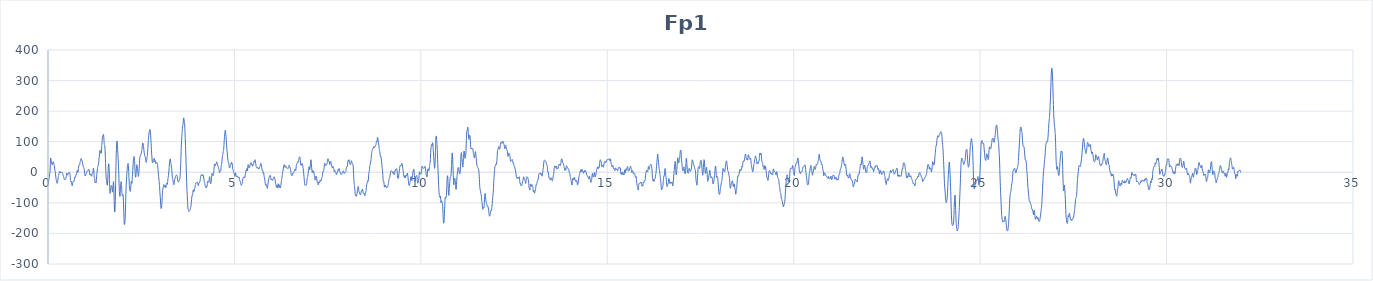
| Category | Fp1 |
|---|---|
| 0.0 | -30.1 |
| 0.0078125 | -34.2 |
| 0.015625 | -29.4 |
| 0.0234375 | -22.9 |
| 0.03125 | -19.9 |
| 0.0390625 | -12.9 |
| 0.046875 | -4.4 |
| 0.0546875 | 4.5 |
| 0.0625 | 26 |
| 0.0703125 | 46.8 |
| 0.078125 | 43.8 |
| 0.0859375 | 34.8 |
| 0.09375 | 35.4 |
| 0.1015625 | 30.7 |
| 0.109375 | 24 |
| 0.1171875 | 25.7 |
| 0.125 | 28.2 |
| 0.1328125 | 31.4 |
| 0.140625 | 34.7 |
| 0.1484375 | 31 |
| 0.15625 | 27.1 |
| 0.1640625 | 25.2 |
| 0.171875 | 17.9 |
| 0.1796875 | 10.5 |
| 0.1875 | 5.8 |
| 0.1953125 | -1.5 |
| 0.203125 | -8.7 |
| 0.2109375 | -15.7 |
| 0.21875 | -23.9 |
| 0.2265625 | -28.2 |
| 0.234375 | -31.4 |
| 0.2421875 | -35.9 |
| 0.25 | -34 |
| 0.2578125 | -29.1 |
| 0.265625 | -25.5 |
| 0.2734375 | -17.5 |
| 0.28125 | -11.3 |
| 0.2890625 | -9.8 |
| 0.296875 | -3.2 |
| 0.3046875 | 2.1 |
| 0.3125 | -0.7 |
| 0.3203125 | -0.9 |
| 0.328125 | 2 |
| 0.3359375 | 0 |
| 0.34375 | -2.1 |
| 0.3515625 | -1.1 |
| 0.359375 | -0.9 |
| 0.3671875 | 0 |
| 0.375 | 0.8 |
| 0.3828125 | -1.6 |
| 0.390625 | -3.5 |
| 0.3984375 | -5.6 |
| 0.40625 | -11 |
| 0.4140625 | -13.5 |
| 0.421875 | -14.4 |
| 0.4296875 | -20 |
| 0.4375 | -23.9 |
| 0.4453125 | -23.2 |
| 0.453125 | -23.8 |
| 0.4609375 | -24.8 |
| 0.46875 | -23.8 |
| 0.4765625 | -21.7 |
| 0.484375 | -18 |
| 0.4921875 | -11.2 |
| 0.5 | -3.8 |
| 0.5078125 | -2.5 |
| 0.515625 | -7.4 |
| 0.5234375 | -9.6 |
| 0.53125 | -6.9 |
| 0.5390625 | -5.1 |
| 0.546875 | -5.8 |
| 0.5546875 | -4.1 |
| 0.5625 | -0.3 |
| 0.5703125 | -0.2 |
| 0.578125 | -2.8 |
| 0.5859375 | -4.4 |
| 0.59375 | -10.8 |
| 0.6015625 | -23.3 |
| 0.609375 | -30.4 |
| 0.6171875 | -29.8 |
| 0.625 | -30.4 |
| 0.6328125 | -34.8 |
| 0.640625 | -40.5 |
| 0.6484375 | -44.1 |
| 0.65625 | -41 |
| 0.6640625 | -34.5 |
| 0.671875 | -30.8 |
| 0.6796875 | -29.3 |
| 0.6875 | -29.5 |
| 0.6953125 | -30.6 |
| 0.703125 | -26.8 |
| 0.7109375 | -19.2 |
| 0.71875 | -15.2 |
| 0.7265625 | -15.6 |
| 0.734375 | -16.6 |
| 0.7421875 | -13.4 |
| 0.75 | -7.4 |
| 0.7578125 | -6 |
| 0.765625 | -7 |
| 0.7734375 | -1.7 |
| 0.78125 | 5.6 |
| 0.7890625 | 5.5 |
| 0.796875 | 0.3 |
| 0.8046875 | 0.4 |
| 0.8125 | 8.8 |
| 0.8203125 | 17.8 |
| 0.828125 | 22.7 |
| 0.8359375 | 24 |
| 0.84375 | 23.2 |
| 0.8515625 | 26.4 |
| 0.859375 | 32.9 |
| 0.8671875 | 35 |
| 0.875 | 37.9 |
| 0.8828125 | 44.4 |
| 0.890625 | 44.3 |
| 0.8984375 | 39.8 |
| 0.90625 | 39.5 |
| 0.9140625 | 39.3 |
| 0.921875 | 34.8 |
| 0.9296875 | 28.6 |
| 0.9375 | 22.7 |
| 0.9453125 | 18.4 |
| 0.953125 | 16.5 |
| 0.9609375 | 15.5 |
| 0.96875 | 11.3 |
| 0.9765625 | 4.5 |
| 0.984375 | -3.1 |
| 0.9921875 | -10.6 |
| 1.0 | -11.7 |
| 1.0078125 | -7.8 |
| 1.015625 | -7.6 |
| 1.0234375 | -6.7 |
| 1.03125 | -1.2 |
| 1.0390625 | 1.5 |
| 1.046875 | 2.1 |
| 1.0546875 | 3.6 |
| 1.0625 | 2.7 |
| 1.0703125 | 3.5 |
| 1.078125 | 8.4 |
| 1.0859375 | 10.1 |
| 1.09375 | 8.7 |
| 1.1015625 | 8.7 |
| 1.109375 | 4.6 |
| 1.1171875 | -4.8 |
| 1.125 | -9.4 |
| 1.1328125 | -7.3 |
| 1.140625 | -5.5 |
| 1.1484375 | -5.7 |
| 1.15625 | -8 |
| 1.1640625 | -12.3 |
| 1.171875 | -12.5 |
| 1.1796875 | -6.9 |
| 1.1875 | -2.9 |
| 1.1953125 | -2.1 |
| 1.203125 | 0.7 |
| 1.2109375 | 7.2 |
| 1.21875 | 13.1 |
| 1.2265625 | 8.6 |
| 1.234375 | -6.9 |
| 1.2421875 | -16.7 |
| 1.25 | -20 |
| 1.2578125 | -28.8 |
| 1.265625 | -34.5 |
| 1.2734375 | -32.4 |
| 1.28125 | -34.3 |
| 1.2890625 | -34.9 |
| 1.296875 | -24.6 |
| 1.3046875 | -11.8 |
| 1.3125 | -3.2 |
| 1.3203125 | 4.2 |
| 1.328125 | 12.3 |
| 1.3359375 | 18.7 |
| 1.34375 | 21.5 |
| 1.3515625 | 24.2 |
| 1.359375 | 31.3 |
| 1.3671875 | 42.1 |
| 1.375 | 52.1 |
| 1.3828125 | 61.2 |
| 1.390625 | 69.9 |
| 1.3984375 | 71.6 |
| 1.40625 | 66.8 |
| 1.4140625 | 63.8 |
| 1.421875 | 61.3 |
| 1.4296875 | 63.6 |
| 1.4375 | 76.8 |
| 1.4453125 | 91.3 |
| 1.453125 | 103.2 |
| 1.4609375 | 114.8 |
| 1.46875 | 119.4 |
| 1.4765625 | 120.2 |
| 1.484375 | 124.2 |
| 1.4921875 | 122.2 |
| 1.5 | 108 |
| 1.5078125 | 93.4 |
| 1.515625 | 89.2 |
| 1.5234375 | 86.7 |
| 1.53125 | 71.6 |
| 1.5390625 | 45.5 |
| 1.546875 | 17.4 |
| 1.5546875 | -5.3 |
| 1.5625 | -18.6 |
| 1.5703125 | -27.5 |
| 1.578125 | -36.2 |
| 1.5859375 | -42 |
| 1.59375 | -41.4 |
| 1.6015625 | -28.6 |
| 1.609375 | -4.7 |
| 1.6171875 | 17.2 |
| 1.625 | 27.8 |
| 1.6328125 | 25.4 |
| 1.640625 | 9.3 |
| 1.6484375 | -20.3 |
| 1.65625 | -53.1 |
| 1.6640625 | -69.4 |
| 1.671875 | -66.4 |
| 1.6796875 | -58.5 |
| 1.6875 | -50.1 |
| 1.6953125 | -43.6 |
| 1.703125 | -44.2 |
| 1.7109375 | -46.4 |
| 1.71875 | -51.6 |
| 1.7265625 | -63.2 |
| 1.734375 | -64.7 |
| 1.7421875 | -51.4 |
| 1.75 | -36.9 |
| 1.7578125 | -30.4 |
| 1.765625 | -46.6 |
| 1.7734375 | -85 |
| 1.78125 | -116.8 |
| 1.7890625 | -130.1 |
| 1.796875 | -125.4 |
| 1.8046875 | -93 |
| 1.8125 | -42.2 |
| 1.8203125 | 6.5 |
| 1.828125 | 48.1 |
| 1.8359375 | 78.9 |
| 1.84375 | 96.9 |
| 1.8515625 | 102.5 |
| 1.859375 | 92.3 |
| 1.8671875 | 74.4 |
| 1.875 | 58.3 |
| 1.8828125 | 40.7 |
| 1.890625 | 20.3 |
| 1.8984375 | -4.7 |
| 1.90625 | -36.6 |
| 1.9140625 | -63 |
| 1.921875 | -75.9 |
| 1.9296875 | -79 |
| 1.9375 | -69.1 |
| 1.9453125 | -49.1 |
| 1.953125 | -34.6 |
| 1.9609375 | -30.5 |
| 1.96875 | -35.8 |
| 1.9765625 | -51.9 |
| 1.984375 | -69 |
| 1.9921875 | -75.9 |
| 2.0 | -74.7 |
| 2.0078125 | -72.4 |
| 2.015625 | -76.7 |
| 2.0234375 | -94.9 |
| 2.03125 | -124.9 |
| 2.0390625 | -154.7 |
| 2.046875 | -170.6 |
| 2.0546875 | -170.4 |
| 2.0625 | -162.5 |
| 2.0703125 | -146.3 |
| 2.078125 | -116.8 |
| 2.0859375 | -82.8 |
| 2.09375 | -54.2 |
| 2.1015625 | -31 |
| 2.109375 | -14.6 |
| 2.1171875 | -1.3 |
| 2.125 | 13.3 |
| 2.1328125 | 22.1 |
| 2.140625 | 25.9 |
| 2.1484375 | 29.2 |
| 2.15625 | 21.7 |
| 2.1640625 | 2.8 |
| 2.171875 | -17.4 |
| 2.1796875 | -39.2 |
| 2.1875 | -55.5 |
| 2.1953125 | -59.7 |
| 2.203125 | -61.9 |
| 2.2109375 | -61.9 |
| 2.21875 | -51.2 |
| 2.2265625 | -36.6 |
| 2.234375 | -29.6 |
| 2.2421875 | -33 |
| 2.25 | -36.2 |
| 2.2578125 | -26.6 |
| 2.265625 | -9.5 |
| 2.2734375 | 5.5 |
| 2.28125 | 21.3 |
| 2.2890625 | 36.3 |
| 2.296875 | 45.3 |
| 2.3046875 | 51.3 |
| 2.3125 | 51 |
| 2.3203125 | 38.3 |
| 2.328125 | 19.1 |
| 2.3359375 | 1.5 |
| 2.34375 | -11.9 |
| 2.3515625 | -16.4 |
| 2.359375 | -10.3 |
| 2.3671875 | 3.9 |
| 2.375 | 19.3 |
| 2.3828125 | 25.1 |
| 2.390625 | 20.1 |
| 2.3984375 | 13.4 |
| 2.40625 | 6.7 |
| 2.4140625 | -3.8 |
| 2.421875 | -13.8 |
| 2.4296875 | -12.4 |
| 2.4375 | -0.5 |
| 2.4453125 | 13.1 |
| 2.453125 | 29.2 |
| 2.4609375 | 44.8 |
| 2.46875 | 51.6 |
| 2.4765625 | 55 |
| 2.484375 | 58.4 |
| 2.4921875 | 58.3 |
| 2.5 | 60.6 |
| 2.5078125 | 66.9 |
| 2.515625 | 71.6 |
| 2.5234375 | 78.7 |
| 2.53125 | 88.9 |
| 2.5390625 | 94.9 |
| 2.546875 | 95.5 |
| 2.5546875 | 92.1 |
| 2.5625 | 84.3 |
| 2.5703125 | 74.3 |
| 2.578125 | 65.8 |
| 2.5859375 | 60 |
| 2.59375 | 55.3 |
| 2.6015625 | 51.9 |
| 2.609375 | 48.9 |
| 2.6171875 | 42.9 |
| 2.625 | 35.3 |
| 2.6328125 | 32.4 |
| 2.640625 | 35.6 |
| 2.6484375 | 41.5 |
| 2.65625 | 47.5 |
| 2.6640625 | 55.1 |
| 2.671875 | 66.5 |
| 2.6796875 | 80.6 |
| 2.6875 | 96.6 |
| 2.6953125 | 111.1 |
| 2.703125 | 120.8 |
| 2.7109375 | 128.8 |
| 2.71875 | 135.5 |
| 2.7265625 | 138.9 |
| 2.734375 | 140.2 |
| 2.7421875 | 136.2 |
| 2.75 | 125.5 |
| 2.7578125 | 111.8 |
| 2.765625 | 93.6 |
| 2.7734375 | 73.6 |
| 2.78125 | 59.3 |
| 2.7890625 | 46.4 |
| 2.796875 | 34 |
| 2.8046875 | 30.4 |
| 2.8125 | 32.8 |
| 2.8203125 | 35.7 |
| 2.828125 | 39.9 |
| 2.8359375 | 42.9 |
| 2.84375 | 44.8 |
| 2.8515625 | 45.5 |
| 2.859375 | 39 |
| 2.8671875 | 33.8 |
| 2.875 | 37.7 |
| 2.8828125 | 36.6 |
| 2.890625 | 28.8 |
| 2.8984375 | 28.1 |
| 2.90625 | 31.6 |
| 2.9140625 | 31.9 |
| 2.921875 | 31.3 |
| 2.9296875 | 30.1 |
| 2.9375 | 26 |
| 2.9453125 | 16.5 |
| 2.953125 | 3.9 |
| 2.9609375 | -6 |
| 2.96875 | -15.2 |
| 2.9765625 | -25.4 |
| 2.984375 | -34.4 |
| 2.9921875 | -46.7 |
| 3.0 | -62.9 |
| 3.0078125 | -76.3 |
| 3.015625 | -90.8 |
| 3.0234375 | -108.3 |
| 3.03125 | -117.8 |
| 3.0390625 | -117.9 |
| 3.046875 | -114.5 |
| 3.0546875 | -101.6 |
| 3.0625 | -80.2 |
| 3.0703125 | -65.1 |
| 3.078125 | -57.5 |
| 3.0859375 | -50.7 |
| 3.09375 | -46.3 |
| 3.1015625 | -42.6 |
| 3.109375 | -40.3 |
| 3.1171875 | -44.5 |
| 3.125 | -48.6 |
| 3.1328125 | -45.8 |
| 3.140625 | -42.4 |
| 3.1484375 | -45.5 |
| 3.15625 | -50.5 |
| 3.1640625 | -47.5 |
| 3.171875 | -39.3 |
| 3.1796875 | -35.9 |
| 3.1875 | -36.8 |
| 3.1953125 | -39.2 |
| 3.203125 | -38.4 |
| 3.2109375 | -29.1 |
| 3.21875 | -20.1 |
| 3.2265625 | -15 |
| 3.234375 | -5.8 |
| 3.2421875 | 4.4 |
| 3.25 | 15.7 |
| 3.2578125 | 30.9 |
| 3.265625 | 39.6 |
| 3.2734375 | 42.5 |
| 3.28125 | 43.8 |
| 3.2890625 | 37 |
| 3.296875 | 28.8 |
| 3.3046875 | 24.2 |
| 3.3125 | 16.4 |
| 3.3203125 | 6.4 |
| 3.328125 | -6.1 |
| 3.3359375 | -18.2 |
| 3.34375 | -21.3 |
| 3.3515625 | -24.4 |
| 3.359375 | -33.2 |
| 3.3671875 | -38.6 |
| 3.375 | -40.8 |
| 3.3828125 | -38.1 |
| 3.390625 | -28.9 |
| 3.3984375 | -23.8 |
| 3.40625 | -21.4 |
| 3.4140625 | -15.5 |
| 3.421875 | -12.7 |
| 3.4296875 | -12.2 |
| 3.4375 | -9.7 |
| 3.4453125 | -9 |
| 3.453125 | -9.5 |
| 3.4609375 | -11.4 |
| 3.46875 | -17.9 |
| 3.4765625 | -25.3 |
| 3.484375 | -29.6 |
| 3.4921875 | -31.3 |
| 3.5 | -31.9 |
| 3.5078125 | -31.2 |
| 3.515625 | -28.6 |
| 3.5234375 | -26.1 |
| 3.53125 | -23.6 |
| 3.5390625 | -16.7 |
| 3.546875 | -5.3 |
| 3.5546875 | 11.5 |
| 3.5625 | 38.3 |
| 3.5703125 | 68.3 |
| 3.578125 | 92.1 |
| 3.5859375 | 109.6 |
| 3.59375 | 124 |
| 3.6015625 | 137.7 |
| 3.609375 | 148.3 |
| 3.6171875 | 153.3 |
| 3.625 | 161.2 |
| 3.6328125 | 173.8 |
| 3.640625 | 178.1 |
| 3.6484375 | 172.5 |
| 3.65625 | 166.8 |
| 3.6640625 | 159.6 |
| 3.671875 | 141.4 |
| 3.6796875 | 114.2 |
| 3.6875 | 88.1 |
| 3.6953125 | 62.3 |
| 3.703125 | 31.5 |
| 3.7109375 | -0.4 |
| 3.71875 | -30.7 |
| 3.7265625 | -56.7 |
| 3.734375 | -75.4 |
| 3.7421875 | -94.4 |
| 3.75 | -113.3 |
| 3.7578125 | -120.6 |
| 3.765625 | -122.2 |
| 3.7734375 | -126.6 |
| 3.78125 | -128.4 |
| 3.7890625 | -126.7 |
| 3.796875 | -125.6 |
| 3.8046875 | -124.4 |
| 3.8125 | -122 |
| 3.8203125 | -118.8 |
| 3.828125 | -115.5 |
| 3.8359375 | -108.7 |
| 3.84375 | -98.1 |
| 3.8515625 | -88.6 |
| 3.859375 | -80 |
| 3.8671875 | -74.6 |
| 3.875 | -75.2 |
| 3.8828125 | -70.6 |
| 3.890625 | -59.9 |
| 3.8984375 | -57.1 |
| 3.90625 | -61.5 |
| 3.9140625 | -63.3 |
| 3.921875 | -60.5 |
| 3.9296875 | -55.9 |
| 3.9375 | -52.7 |
| 3.9453125 | -47.6 |
| 3.953125 | -39.7 |
| 3.9609375 | -36.7 |
| 3.96875 | -36.7 |
| 3.9765625 | -33.5 |
| 3.984375 | -31.9 |
| 3.9921875 | -33.3 |
| 4.0 | -33 |
| 4.0078125 | -32.6 |
| 4.015625 | -35.2 |
| 4.0234375 | -40.8 |
| 4.03125 | -44.1 |
| 4.0390625 | -40.4 |
| 4.046875 | -35.3 |
| 4.0546875 | -34.5 |
| 4.0625 | -33.7 |
| 4.0703125 | -30.7 |
| 4.078125 | -27.7 |
| 4.0859375 | -21.5 |
| 4.09375 | -13.1 |
| 4.1015625 | -9.5 |
| 4.109375 | -9.8 |
| 4.1171875 | -9 |
| 4.125 | -7.4 |
| 4.1328125 | -8.2 |
| 4.140625 | -11.6 |
| 4.1484375 | -12 |
| 4.15625 | -8.5 |
| 4.1640625 | -9.3 |
| 4.171875 | -15.3 |
| 4.1796875 | -21.8 |
| 4.1875 | -28.3 |
| 4.1953125 | -31.9 |
| 4.203125 | -34.1 |
| 4.2109375 | -41.3 |
| 4.21875 | -46.6 |
| 4.2265625 | -46.9 |
| 4.234375 | -50.2 |
| 4.2421875 | -50.9 |
| 4.25 | -46.8 |
| 4.2578125 | -48.1 |
| 4.265625 | -47.4 |
| 4.2734375 | -36.6 |
| 4.28125 | -29.7 |
| 4.2890625 | -31.4 |
| 4.296875 | -32.2 |
| 4.3046875 | -32.2 |
| 4.3125 | -32.2 |
| 4.3203125 | -26.8 |
| 4.328125 | -17.3 |
| 4.3359375 | -14.1 |
| 4.34375 | -22.3 |
| 4.3515625 | -32.9 |
| 4.359375 | -37.1 |
| 4.3671875 | -37 |
| 4.375 | -33.2 |
| 4.3828125 | -22.9 |
| 4.390625 | -10.5 |
| 4.3984375 | -4 |
| 4.40625 | -4.3 |
| 4.4140625 | -7.7 |
| 4.421875 | -10.9 |
| 4.4296875 | -11.1 |
| 4.4375 | -7.5 |
| 4.4453125 | 0.1 |
| 4.453125 | 11.3 |
| 4.4609375 | 21.8 |
| 4.46875 | 27.4 |
| 4.4765625 | 25.9 |
| 4.484375 | 21.6 |
| 4.4921875 | 22.6 |
| 4.5 | 26 |
| 4.5078125 | 27 |
| 4.515625 | 30.5 |
| 4.5234375 | 34.2 |
| 4.53125 | 32.8 |
| 4.5390625 | 28.9 |
| 4.546875 | 24.3 |
| 4.5546875 | 21 |
| 4.5625 | 19 |
| 4.5703125 | 15.3 |
| 4.578125 | 12.7 |
| 4.5859375 | 9.4 |
| 4.59375 | 2.1 |
| 4.6015625 | -1.2 |
| 4.609375 | 1.8 |
| 4.6171875 | 4.1 |
| 4.625 | 3.8 |
| 4.6328125 | 5.6 |
| 4.640625 | 15 |
| 4.6484375 | 24.4 |
| 4.65625 | 26.6 |
| 4.6640625 | 33.9 |
| 4.671875 | 46.6 |
| 4.6796875 | 52.3 |
| 4.6875 | 58 |
| 4.6953125 | 66.5 |
| 4.703125 | 69.2 |
| 4.7109375 | 74 |
| 4.71875 | 88 |
| 4.7265625 | 103.7 |
| 4.734375 | 116.8 |
| 4.7421875 | 127.3 |
| 4.75 | 135.4 |
| 4.7578125 | 137.6 |
| 4.765625 | 129.7 |
| 4.7734375 | 117.9 |
| 4.78125 | 106 |
| 4.7890625 | 89.8 |
| 4.796875 | 75.4 |
| 4.8046875 | 66.2 |
| 4.8125 | 56 |
| 4.8203125 | 46.6 |
| 4.828125 | 38.4 |
| 4.8359375 | 31.5 |
| 4.84375 | 31.1 |
| 4.8515625 | 27.9 |
| 4.859375 | 17.6 |
| 4.8671875 | 13.8 |
| 4.875 | 15.3 |
| 4.8828125 | 17 |
| 4.890625 | 22.7 |
| 4.8984375 | 24.3 |
| 4.90625 | 24.6 |
| 4.9140625 | 31.8 |
| 4.921875 | 32.8 |
| 4.9296875 | 28.5 |
| 4.9375 | 29.2 |
| 4.9453125 | 23.5 |
| 4.953125 | 12.2 |
| 4.9609375 | 7.9 |
| 4.96875 | 5.5 |
| 4.9765625 | 2 |
| 4.984375 | -0.7 |
| 4.9921875 | -4.4 |
| 5.0 | -8.3 |
| 5.0078125 | -12.6 |
| 5.015625 | -12.7 |
| 5.0234375 | -4.5 |
| 5.03125 | -1.7 |
| 5.0390625 | -8.7 |
| 5.046875 | -12.3 |
| 5.0546875 | -12.5 |
| 5.0625 | -14.9 |
| 5.0703125 | -14.9 |
| 5.078125 | -12.3 |
| 5.0859375 | -12.5 |
| 5.09375 | -15.4 |
| 5.1015625 | -16.9 |
| 5.109375 | -18 |
| 5.1171875 | -19.4 |
| 5.125 | -17.2 |
| 5.1328125 | -17.3 |
| 5.140625 | -24.5 |
| 5.1484375 | -28.6 |
| 5.15625 | -30.3 |
| 5.1640625 | -36 |
| 5.171875 | -39.1 |
| 5.1796875 | -40.9 |
| 5.1875 | -42.7 |
| 5.1953125 | -39.3 |
| 5.203125 | -36.8 |
| 5.2109375 | -34.7 |
| 5.21875 | -25.9 |
| 5.2265625 | -19.7 |
| 5.234375 | -18.8 |
| 5.2421875 | -16.6 |
| 5.25 | -16.2 |
| 5.2578125 | -15.8 |
| 5.265625 | -14.6 |
| 5.2734375 | -17.7 |
| 5.28125 | -17.1 |
| 5.2890625 | -9.1 |
| 5.296875 | -3.4 |
| 5.3046875 | 1.5 |
| 5.3125 | 6.2 |
| 5.3203125 | 4.4 |
| 5.328125 | 6.2 |
| 5.3359375 | 12.4 |
| 5.34375 | 7.5 |
| 5.3515625 | 4.7 |
| 5.359375 | 18 |
| 5.3671875 | 25.2 |
| 5.375 | 19.4 |
| 5.3828125 | 15.6 |
| 5.390625 | 14.4 |
| 5.3984375 | 14.8 |
| 5.40625 | 17.5 |
| 5.4140625 | 20.1 |
| 5.421875 | 24.9 |
| 5.4296875 | 28.6 |
| 5.4375 | 28.6 |
| 5.4453125 | 31.3 |
| 5.453125 | 30.8 |
| 5.4609375 | 24.7 |
| 5.46875 | 24.2 |
| 5.4765625 | 25.5 |
| 5.484375 | 20.8 |
| 5.4921875 | 20.5 |
| 5.5 | 25.5 |
| 5.5078125 | 25.9 |
| 5.515625 | 28.4 |
| 5.5234375 | 36.1 |
| 5.53125 | 36.4 |
| 5.5390625 | 34.4 |
| 5.546875 | 39.6 |
| 5.5546875 | 40.8 |
| 5.5625 | 34.1 |
| 5.5703125 | 28.4 |
| 5.578125 | 22.7 |
| 5.5859375 | 17.3 |
| 5.59375 | 16.4 |
| 5.6015625 | 15.2 |
| 5.609375 | 13.3 |
| 5.6171875 | 14.9 |
| 5.625 | 16.4 |
| 5.6328125 | 14 |
| 5.640625 | 11.8 |
| 5.6484375 | 11.6 |
| 5.65625 | 11 |
| 5.6640625 | 12.1 |
| 5.671875 | 16.2 |
| 5.6796875 | 19 |
| 5.6875 | 19.6 |
| 5.6953125 | 22.6 |
| 5.703125 | 27.8 |
| 5.7109375 | 29.1 |
| 5.71875 | 25.2 |
| 5.7265625 | 20.9 |
| 5.734375 | 14.9 |
| 5.7421875 | 7.6 |
| 5.75 | 6.8 |
| 5.7578125 | 6.8 |
| 5.765625 | -0.8 |
| 5.7734375 | -3.7 |
| 5.78125 | -0.8 |
| 5.7890625 | -5.6 |
| 5.796875 | -13.7 |
| 5.8046875 | -18.4 |
| 5.8125 | -23.8 |
| 5.8203125 | -30.6 |
| 5.828125 | -38.1 |
| 5.8359375 | -42.6 |
| 5.84375 | -40.7 |
| 5.8515625 | -39.7 |
| 5.859375 | -42.6 |
| 5.8671875 | -45.8 |
| 5.875 | -50 |
| 5.8828125 | -52.7 |
| 5.890625 | -47.7 |
| 5.8984375 | -38.7 |
| 5.90625 | -31.6 |
| 5.9140625 | -25.8 |
| 5.921875 | -21.7 |
| 5.9296875 | -18.2 |
| 5.9375 | -13.1 |
| 5.9453125 | -10.7 |
| 5.953125 | -11.9 |
| 5.9609375 | -11 |
| 5.96875 | -12.3 |
| 5.9765625 | -20.2 |
| 5.984375 | -25.2 |
| 5.9921875 | -23.1 |
| 6.0 | -22.8 |
| 6.0078125 | -25.9 |
| 6.015625 | -26.6 |
| 6.0234375 | -26.2 |
| 6.03125 | -25.8 |
| 6.0390625 | -21.6 |
| 6.046875 | -18.3 |
| 6.0546875 | -18.3 |
| 6.0625 | -15.1 |
| 6.0703125 | -15.3 |
| 6.078125 | -20 |
| 6.0859375 | -20.5 |
| 6.09375 | -26 |
| 6.1015625 | -36.7 |
| 6.109375 | -39 |
| 6.1171875 | -42.4 |
| 6.125 | -49.1 |
| 6.1328125 | -46.2 |
| 6.140625 | -41.9 |
| 6.1484375 | -46.6 |
| 6.15625 | -51.6 |
| 6.1640625 | -47.7 |
| 6.171875 | -38.7 |
| 6.1796875 | -38.4 |
| 6.1875 | -46.4 |
| 6.1953125 | -49.6 |
| 6.203125 | -45.5 |
| 6.2109375 | -41.1 |
| 6.21875 | -43.8 |
| 6.2265625 | -50.7 |
| 6.234375 | -50.7 |
| 6.2421875 | -45.7 |
| 6.25 | -39.9 |
| 6.2578125 | -30.4 |
| 6.265625 | -23.9 |
| 6.2734375 | -20 |
| 6.28125 | -11 |
| 6.2890625 | -3.3 |
| 6.296875 | 1.3 |
| 6.3046875 | 7.5 |
| 6.3125 | 12.3 |
| 6.3203125 | 17.5 |
| 6.328125 | 23.7 |
| 6.3359375 | 24.7 |
| 6.34375 | 21.2 |
| 6.3515625 | 17.1 |
| 6.359375 | 16 |
| 6.3671875 | 19.8 |
| 6.375 | 21.4 |
| 6.3828125 | 19.1 |
| 6.390625 | 18.3 |
| 6.3984375 | 16.5 |
| 6.40625 | 13.1 |
| 6.4140625 | 12.9 |
| 6.421875 | 13.4 |
| 6.4296875 | 12.3 |
| 6.4375 | 12.9 |
| 6.4453125 | 13.5 |
| 6.453125 | 13.9 |
| 6.4609375 | 19.1 |
| 6.46875 | 23.5 |
| 6.4765625 | 20.4 |
| 6.484375 | 16.7 |
| 6.4921875 | 15.8 |
| 6.5 | 12.4 |
| 6.5078125 | 6.4 |
| 6.515625 | -0.5 |
| 6.5234375 | -6.5 |
| 6.53125 | -8.7 |
| 6.5390625 | -10.7 |
| 6.546875 | -11.1 |
| 6.5546875 | -5.9 |
| 6.5625 | -3.4 |
| 6.5703125 | -4.9 |
| 6.578125 | -3.3 |
| 6.5859375 | -1.4 |
| 6.59375 | 0.3 |
| 6.6015625 | 4.3 |
| 6.609375 | 6.2 |
| 6.6171875 | 7.3 |
| 6.625 | 10.7 |
| 6.6328125 | 10.7 |
| 6.640625 | 6 |
| 6.6484375 | 7 |
| 6.65625 | 17.5 |
| 6.6640625 | 25.5 |
| 6.671875 | 26.3 |
| 6.6796875 | 29 |
| 6.6875 | 31.3 |
| 6.6953125 | 30.3 |
| 6.703125 | 33.8 |
| 6.7109375 | 36.8 |
| 6.71875 | 35.7 |
| 6.7265625 | 40.8 |
| 6.734375 | 47.5 |
| 6.7421875 | 49.2 |
| 6.75 | 50.7 |
| 6.7578125 | 48.1 |
| 6.765625 | 39.4 |
| 6.7734375 | 30.9 |
| 6.78125 | 24.8 |
| 6.7890625 | 22.1 |
| 6.796875 | 23.6 |
| 6.8046875 | 27.2 |
| 6.8125 | 28.9 |
| 6.8203125 | 26.6 |
| 6.828125 | 23.8 |
| 6.8359375 | 19.8 |
| 6.84375 | 11.9 |
| 6.8515625 | 3.5 |
| 6.859375 | -5.2 |
| 6.8671875 | -16.1 |
| 6.875 | -27.2 |
| 6.8828125 | -37.5 |
| 6.890625 | -42.1 |
| 6.8984375 | -40.9 |
| 6.90625 | -41.9 |
| 6.9140625 | -43.4 |
| 6.921875 | -42 |
| 6.9296875 | -41.5 |
| 6.9375 | -37.2 |
| 6.9453125 | -26.3 |
| 6.953125 | -18.6 |
| 6.9609375 | -16.8 |
| 6.96875 | -12.4 |
| 6.9765625 | -4.2 |
| 6.984375 | 3.7 |
| 6.9921875 | 12.2 |
| 7.0 | 18 |
| 7.0078125 | 14.9 |
| 7.015625 | 8.7 |
| 7.0234375 | 9.4 |
| 7.03125 | 17.3 |
| 7.0390625 | 28.8 |
| 7.046875 | 39.4 |
| 7.0546875 | 41 |
| 7.0625 | 30.2 |
| 7.0703125 | 16.7 |
| 7.078125 | 6.6 |
| 7.0859375 | -1 |
| 7.09375 | -0.5 |
| 7.1015625 | 5.6 |
| 7.109375 | 4.9 |
| 7.1171875 | 2.8 |
| 7.125 | 3.5 |
| 7.1328125 | -2.1 |
| 7.140625 | -9.6 |
| 7.1484375 | -14.3 |
| 7.15625 | -21.5 |
| 7.1640625 | -25.7 |
| 7.171875 | -20.8 |
| 7.1796875 | -13.9 |
| 7.1875 | -12.3 |
| 7.1953125 | -13.9 |
| 7.203125 | -15.4 |
| 7.2109375 | -22.4 |
| 7.21875 | -32 |
| 7.2265625 | -32.2 |
| 7.234375 | -32.4 |
| 7.2421875 | -39.8 |
| 7.25 | -41 |
| 7.2578125 | -35.6 |
| 7.265625 | -32.1 |
| 7.2734375 | -31.2 |
| 7.28125 | -33.9 |
| 7.2890625 | -33.5 |
| 7.296875 | -26.9 |
| 7.3046875 | -25.2 |
| 7.3125 | -28.4 |
| 7.3203125 | -28.7 |
| 7.328125 | -26.1 |
| 7.3359375 | -21.7 |
| 7.34375 | -17.8 |
| 7.3515625 | -16.2 |
| 7.359375 | -10.8 |
| 7.3671875 | -1.3 |
| 7.375 | 3.8 |
| 7.3828125 | 3.3 |
| 7.390625 | 3.9 |
| 7.3984375 | 8.2 |
| 7.40625 | 15.6 |
| 7.4140625 | 25 |
| 7.421875 | 30.2 |
| 7.4296875 | 26.7 |
| 7.4375 | 22.4 |
| 7.4453125 | 23.1 |
| 7.453125 | 23.2 |
| 7.4609375 | 22.6 |
| 7.46875 | 24.2 |
| 7.4765625 | 25 |
| 7.484375 | 28.3 |
| 7.4921875 | 36.1 |
| 7.5 | 42.1 |
| 7.5078125 | 44.5 |
| 7.515625 | 42.8 |
| 7.5234375 | 37.8 |
| 7.53125 | 37 |
| 7.5390625 | 36.5 |
| 7.546875 | 29.8 |
| 7.5546875 | 25.3 |
| 7.5625 | 27.4 |
| 7.5703125 | 32.1 |
| 7.578125 | 36.3 |
| 7.5859375 | 34.9 |
| 7.59375 | 28.5 |
| 7.6015625 | 23.4 |
| 7.609375 | 20.2 |
| 7.6171875 | 17.1 |
| 7.625 | 14.2 |
| 7.6328125 | 15 |
| 7.640625 | 18.9 |
| 7.6484375 | 18.8 |
| 7.65625 | 15.8 |
| 7.6640625 | 12.1 |
| 7.671875 | 5 |
| 7.6796875 | 2.2 |
| 7.6875 | 5.9 |
| 7.6953125 | 5.2 |
| 7.703125 | 2.5 |
| 7.7109375 | 2.5 |
| 7.71875 | -0.3 |
| 7.7265625 | -4.6 |
| 7.734375 | -7.3 |
| 7.7421875 | -7.6 |
| 7.75 | -3.1 |
| 7.7578125 | 0.1 |
| 7.765625 | -0.2 |
| 7.7734375 | 4.6 |
| 7.78125 | 9 |
| 7.7890625 | 6.3 |
| 7.796875 | 7.2 |
| 7.8046875 | 12.2 |
| 7.8125 | 10.7 |
| 7.8203125 | 5 |
| 7.828125 | 2 |
| 7.8359375 | 0 |
| 7.84375 | -3.3 |
| 7.8515625 | -5.4 |
| 7.859375 | -4.9 |
| 7.8671875 | -5.6 |
| 7.875 | -6.9 |
| 7.8828125 | -3.9 |
| 7.890625 | -0.1 |
| 7.8984375 | 0.4 |
| 7.90625 | 1.9 |
| 7.9140625 | 4.5 |
| 7.921875 | 4.7 |
| 7.9296875 | 2.3 |
| 7.9375 | -1.9 |
| 7.9453125 | -3.7 |
| 7.953125 | -2.3 |
| 7.9609375 | -2 |
| 7.96875 | -1.6 |
| 7.9765625 | 0.6 |
| 7.984375 | 1.9 |
| 7.9921875 | 5.5 |
| 8.0 | 12.8 |
| 8.0078125 | 17.6 |
| 8.015625 | 17.6 |
| 8.0234375 | 17.2 |
| 8.03125 | 22 |
| 8.0390625 | 32.3 |
| 8.046875 | 38.1 |
| 8.0546875 | 36.2 |
| 8.0625 | 36.8 |
| 8.0703125 | 41.2 |
| 8.078125 | 39.7 |
| 8.0859375 | 32.8 |
| 8.09375 | 27.5 |
| 8.1015625 | 26.4 |
| 8.109375 | 26.3 |
| 8.1171875 | 25.1 |
| 8.125 | 28.7 |
| 8.1328125 | 36.8 |
| 8.140625 | 37.5 |
| 8.1484375 | 32.2 |
| 8.15625 | 31.2 |
| 8.1640625 | 30.3 |
| 8.171875 | 26.8 |
| 8.1796875 | 24.5 |
| 8.1875 | 16.6 |
| 8.1953125 | -2.5 |
| 8.203125 | -23 |
| 8.2109375 | -35.3 |
| 8.21875 | -42.7 |
| 8.2265625 | -51.8 |
| 8.234375 | -63.5 |
| 8.2421875 | -73.4 |
| 8.25 | -76.1 |
| 8.2578125 | -73.8 |
| 8.265625 | -75.8 |
| 8.2734375 | -78.4 |
| 8.28125 | -74.9 |
| 8.2890625 | -68.6 |
| 8.296875 | -60.6 |
| 8.3046875 | -52.7 |
| 8.3125 | -48.6 |
| 8.3203125 | -45.9 |
| 8.328125 | -49.6 |
| 8.3359375 | -60.2 |
| 8.34375 | -64.3 |
| 8.3515625 | -64.9 |
| 8.359375 | -70.1 |
| 8.3671875 | -72.8 |
| 8.375 | -73.3 |
| 8.3828125 | -73.8 |
| 8.390625 | -69.8 |
| 8.3984375 | -64.8 |
| 8.40625 | -61.5 |
| 8.4140625 | -59 |
| 8.421875 | -59 |
| 8.4296875 | -56.8 |
| 8.4375 | -54.9 |
| 8.4453125 | -61.3 |
| 8.453125 | -67.3 |
| 8.4609375 | -67.7 |
| 8.46875 | -69.7 |
| 8.4765625 | -70.8 |
| 8.484375 | -69.5 |
| 8.4921875 | -73.4 |
| 8.5 | -77.3 |
| 8.5078125 | -72.2 |
| 8.515625 | -66 |
| 8.5234375 | -64.7 |
| 8.53125 | -60.4 |
| 8.5390625 | -50 |
| 8.546875 | -41.1 |
| 8.5546875 | -37.1 |
| 8.5625 | -34.1 |
| 8.5703125 | -29.1 |
| 8.578125 | -27.1 |
| 8.5859375 | -29.9 |
| 8.59375 | -24.6 |
| 8.6015625 | -8.3 |
| 8.609375 | 1.6 |
| 8.6171875 | 4.8 |
| 8.625 | 13.7 |
| 8.6328125 | 22 |
| 8.640625 | 25.4 |
| 8.6484375 | 30.7 |
| 8.65625 | 35.8 |
| 8.6640625 | 41.1 |
| 8.671875 | 51.6 |
| 8.6796875 | 61.8 |
| 8.6875 | 68.2 |
| 8.6953125 | 72 |
| 8.703125 | 73.8 |
| 8.7109375 | 77.2 |
| 8.71875 | 79.6 |
| 8.7265625 | 79.5 |
| 8.734375 | 83 |
| 8.7421875 | 84.4 |
| 8.75 | 80.7 |
| 8.7578125 | 81 |
| 8.765625 | 82.8 |
| 8.7734375 | 83.7 |
| 8.78125 | 87.3 |
| 8.7890625 | 88.3 |
| 8.796875 | 89.8 |
| 8.8046875 | 97.8 |
| 8.8125 | 101.6 |
| 8.8203125 | 100.3 |
| 8.828125 | 105.8 |
| 8.8359375 | 113.6 |
| 8.84375 | 113.7 |
| 8.8515625 | 107 |
| 8.859375 | 99 |
| 8.8671875 | 93 |
| 8.875 | 86.5 |
| 8.8828125 | 77.8 |
| 8.890625 | 71.7 |
| 8.8984375 | 67.7 |
| 8.90625 | 59 |
| 8.9140625 | 51.8 |
| 8.921875 | 53 |
| 8.9296875 | 52 |
| 8.9375 | 43.9 |
| 8.9453125 | 35.9 |
| 8.953125 | 26.7 |
| 8.9609375 | 15.9 |
| 8.96875 | 8.6 |
| 8.9765625 | -2 |
| 8.984375 | -18.8 |
| 8.9921875 | -29.1 |
| 9.0 | -29.4 |
| 9.0078125 | -31.4 |
| 9.015625 | -40.2 |
| 9.0234375 | -48.2 |
| 9.03125 | -46.9 |
| 9.0390625 | -41.7 |
| 9.046875 | -43 |
| 9.0546875 | -46.9 |
| 9.0625 | -45.9 |
| 9.0703125 | -46.2 |
| 9.078125 | -50.5 |
| 9.0859375 | -50.7 |
| 9.09375 | -47.7 |
| 9.1015625 | -46.8 |
| 9.109375 | -46.8 |
| 9.1171875 | -45.8 |
| 9.125 | -40.6 |
| 9.1328125 | -33 |
| 9.140625 | -28 |
| 9.1484375 | -23.1 |
| 9.15625 | -18.8 |
| 9.1640625 | -17.3 |
| 9.171875 | -12.7 |
| 9.1796875 | -5.2 |
| 9.1875 | 0.2 |
| 9.1953125 | 4.3 |
| 9.203125 | 5.3 |
| 9.2109375 | 3.9 |
| 9.21875 | 2.9 |
| 9.2265625 | 1.6 |
| 9.234375 | 2 |
| 9.2421875 | 0.9 |
| 9.25 | -3.3 |
| 9.2578125 | -1.8 |
| 9.265625 | 1.4 |
| 9.2734375 | -2.4 |
| 9.28125 | -6.8 |
| 9.2890625 | -7.7 |
| 9.296875 | -4.2 |
| 9.3046875 | 4.1 |
| 9.3125 | 7.6 |
| 9.3203125 | 5.6 |
| 9.328125 | 7.8 |
| 9.3359375 | 11.7 |
| 9.34375 | 11.9 |
| 9.3515625 | 11.8 |
| 9.359375 | 9.2 |
| 9.3671875 | -2.5 |
| 9.375 | -15.8 |
| 9.3828125 | -19.7 |
| 9.390625 | -20.1 |
| 9.3984375 | -20.3 |
| 9.40625 | -12.2 |
| 9.4140625 | -1.9 |
| 9.421875 | 3.7 |
| 9.4296875 | 12.1 |
| 9.4375 | 20.4 |
| 9.4453125 | 21.4 |
| 9.453125 | 22 |
| 9.4609375 | 22.8 |
| 9.46875 | 21.4 |
| 9.4765625 | 24.7 |
| 9.484375 | 29.1 |
| 9.4921875 | 28.5 |
| 9.5 | 26.7 |
| 9.5078125 | 20.6 |
| 9.515625 | 12.3 |
| 9.5234375 | 6.7 |
| 9.53125 | -3 |
| 9.5390625 | -12 |
| 9.546875 | -12.7 |
| 9.5546875 | -15.8 |
| 9.5625 | -17.5 |
| 9.5703125 | -11 |
| 9.578125 | -11.7 |
| 9.5859375 | -17.8 |
| 9.59375 | -14.6 |
| 9.6015625 | -9.5 |
| 9.609375 | -10 |
| 9.6171875 | -11.3 |
| 9.625 | -9.4 |
| 9.6328125 | -3.9 |
| 9.640625 | -2.8 |
| 9.6484375 | -9.1 |
| 9.65625 | -16.5 |
| 9.6640625 | -26.7 |
| 9.671875 | -37.5 |
| 9.6796875 | -42 |
| 9.6875 | -43.6 |
| 9.6953125 | -41.6 |
| 9.703125 | -36 |
| 9.7109375 | -32.8 |
| 9.71875 | -27 |
| 9.7265625 | -18.1 |
| 9.734375 | -14 |
| 9.7421875 | -15 |
| 9.75 | -21.9 |
| 9.7578125 | -27.3 |
| 9.765625 | -20 |
| 9.7734375 | -10.6 |
| 9.78125 | -5.8 |
| 9.7890625 | 1.1 |
| 9.796875 | 6.5 |
| 9.8046875 | 9.6 |
| 9.8125 | 10.1 |
| 9.8203125 | 1.8 |
| 9.828125 | -11 |
| 9.8359375 | -23 |
| 9.84375 | -29.7 |
| 9.8515625 | -23.7 |
| 9.859375 | -14.9 |
| 9.8671875 | -13.7 |
| 9.875 | -13.3 |
| 9.8828125 | -10.9 |
| 9.890625 | -11.1 |
| 9.8984375 | -17.9 |
| 9.90625 | -29.2 |
| 9.9140625 | -35.5 |
| 9.921875 | -35.2 |
| 9.9296875 | -33 |
| 9.9375 | -28.9 |
| 9.9453125 | -21.9 |
| 9.953125 | -9.5 |
| 9.9609375 | 1.6 |
| 9.96875 | 0.1 |
| 9.9765625 | -4 |
| 9.984375 | -2.5 |
| 9.9921875 | -4.3 |
| 10.0 | -6.4 |
| 10.0078125 | -4 |
| 10.015625 | 1.6 |
| 10.0234375 | 12.6 |
| 10.03125 | 20.1 |
| 10.0390625 | 19.3 |
| 10.046875 | 18.8 |
| 10.0546875 | 16.9 |
| 10.0625 | 12.7 |
| 10.0703125 | 13 |
| 10.078125 | 14.2 |
| 10.0859375 | 13.3 |
| 10.09375 | 14 |
| 10.1015625 | 16.3 |
| 10.109375 | 19.4 |
| 10.1171875 | 18.7 |
| 10.125 | 12.3 |
| 10.1328125 | 3.7 |
| 10.140625 | -4.6 |
| 10.1484375 | -9.4 |
| 10.15625 | -12.2 |
| 10.1640625 | -15.4 |
| 10.171875 | -9.4 |
| 10.1796875 | 4.1 |
| 10.1875 | 10.7 |
| 10.1953125 | 11.3 |
| 10.203125 | 9.5 |
| 10.2109375 | 5.3 |
| 10.21875 | 6.4 |
| 10.2265625 | 14.3 |
| 10.234375 | 21.8 |
| 10.2421875 | 26.5 |
| 10.25 | 33.4 |
| 10.2578125 | 50.4 |
| 10.265625 | 70.3 |
| 10.2734375 | 80.6 |
| 10.28125 | 87 |
| 10.2890625 | 90.7 |
| 10.296875 | 87.2 |
| 10.3046875 | 88.6 |
| 10.3125 | 96.5 |
| 10.3203125 | 94.5 |
| 10.328125 | 81.4 |
| 10.3359375 | 66.6 |
| 10.34375 | 51.8 |
| 10.3515625 | 37.3 |
| 10.359375 | 23 |
| 10.3671875 | 12.7 |
| 10.375 | 15.1 |
| 10.3828125 | 33.6 |
| 10.390625 | 64.1 |
| 10.3984375 | 97 |
| 10.40625 | 117.6 |
| 10.4140625 | 118.2 |
| 10.421875 | 107.8 |
| 10.4296875 | 97.4 |
| 10.4375 | 82.5 |
| 10.4453125 | 56.8 |
| 10.453125 | 29.1 |
| 10.4609375 | 5.5 |
| 10.46875 | -18.8 |
| 10.4765625 | -42.3 |
| 10.484375 | -59.9 |
| 10.4921875 | -71.8 |
| 10.5 | -79 |
| 10.5078125 | -81.8 |
| 10.515625 | -79.2 |
| 10.5234375 | -77.3 |
| 10.53125 | -87.5 |
| 10.5390625 | -99.5 |
| 10.546875 | -97.5 |
| 10.5546875 | -93.2 |
| 10.5625 | -97.2 |
| 10.5703125 | -100.1 |
| 10.578125 | -101.2 |
| 10.5859375 | -112.1 |
| 10.59375 | -134.1 |
| 10.6015625 | -155.5 |
| 10.609375 | -166.7 |
| 10.6171875 | -165.6 |
| 10.625 | -152.8 |
| 10.6328125 | -132.7 |
| 10.640625 | -109.6 |
| 10.6484375 | -88.5 |
| 10.65625 | -81 |
| 10.6640625 | -84.2 |
| 10.671875 | -83.6 |
| 10.6796875 | -80.3 |
| 10.6875 | -71.5 |
| 10.6953125 | -48.3 |
| 10.703125 | -23.9 |
| 10.7109375 | -11.6 |
| 10.71875 | -11.5 |
| 10.7265625 | -25.5 |
| 10.734375 | -49.7 |
| 10.7421875 | -70.5 |
| 10.75 | -75.6 |
| 10.7578125 | -64.3 |
| 10.765625 | -49.1 |
| 10.7734375 | -36.1 |
| 10.78125 | -23.5 |
| 10.7890625 | -15.5 |
| 10.796875 | -13.9 |
| 10.8046875 | -12.6 |
| 10.8125 | -3.1 |
| 10.8203125 | 18 |
| 10.828125 | 42.4 |
| 10.8359375 | 59.4 |
| 10.84375 | 63.3 |
| 10.8515625 | 50.8 |
| 10.859375 | 26.8 |
| 10.8671875 | -2.7 |
| 10.875 | -30.6 |
| 10.8828125 | -40.9 |
| 10.890625 | -31.8 |
| 10.8984375 | -22.4 |
| 10.90625 | -19.8 |
| 10.9140625 | -20.5 |
| 10.921875 | -27.2 |
| 10.9296875 | -39.8 |
| 10.9375 | -51.6 |
| 10.9453125 | -55.8 |
| 10.953125 | -47.8 |
| 10.9609375 | -30.4 |
| 10.96875 | -15 |
| 10.9765625 | -6.4 |
| 10.984375 | 1.7 |
| 10.9921875 | 10.7 |
| 11.0 | 15.3 |
| 11.0078125 | 15.8 |
| 11.015625 | 12.3 |
| 11.0234375 | 4.1 |
| 11.03125 | -1.2 |
| 11.0390625 | -2.6 |
| 11.046875 | -4.7 |
| 11.0546875 | 0.9 |
| 11.0625 | 19.6 |
| 11.0703125 | 41.3 |
| 11.078125 | 57.7 |
| 11.0859375 | 64.4 |
| 11.09375 | 57.5 |
| 11.1015625 | 44.4 |
| 11.109375 | 32.8 |
| 11.1171875 | 22.2 |
| 11.125 | 16.8 |
| 11.1328125 | 25 |
| 11.140625 | 44.4 |
| 11.1484375 | 61.4 |
| 11.15625 | 68.9 |
| 11.1640625 | 68.7 |
| 11.171875 | 60.1 |
| 11.1796875 | 48 |
| 11.1875 | 45.3 |
| 11.1953125 | 49.2 |
| 11.203125 | 54 |
| 11.2109375 | 70.6 |
| 11.21875 | 99 |
| 11.2265625 | 122.8 |
| 11.234375 | 134 |
| 11.2421875 | 137.1 |
| 11.25 | 142 |
| 11.2578125 | 147.6 |
| 11.265625 | 141.2 |
| 11.2734375 | 125.5 |
| 11.28125 | 112.6 |
| 11.2890625 | 107.6 |
| 11.296875 | 112.6 |
| 11.3046875 | 120 |
| 11.3125 | 121 |
| 11.3203125 | 115.4 |
| 11.328125 | 100.2 |
| 11.3359375 | 82.2 |
| 11.34375 | 76.6 |
| 11.3515625 | 77.1 |
| 11.359375 | 76.2 |
| 11.3671875 | 78.3 |
| 11.375 | 78.6 |
| 11.3828125 | 75.8 |
| 11.390625 | 77.1 |
| 11.3984375 | 74.7 |
| 11.40625 | 64.8 |
| 11.4140625 | 58.3 |
| 11.421875 | 54.3 |
| 11.4296875 | 48.2 |
| 11.4375 | 47.4 |
| 11.4453125 | 54.3 |
| 11.453125 | 62.5 |
| 11.4609375 | 67.7 |
| 11.46875 | 66 |
| 11.4765625 | 56.8 |
| 11.484375 | 45.7 |
| 11.4921875 | 36 |
| 11.5 | 27 |
| 11.5078125 | 20.3 |
| 11.515625 | 17.9 |
| 11.5234375 | 15.6 |
| 11.53125 | 12.7 |
| 11.5390625 | 12.8 |
| 11.546875 | 11.3 |
| 11.5546875 | 3.7 |
| 11.5625 | -7.1 |
| 11.5703125 | -23.1 |
| 11.578125 | -42.8 |
| 11.5859375 | -54.2 |
| 11.59375 | -57.9 |
| 11.6015625 | -62.7 |
| 11.609375 | -67.7 |
| 11.6171875 | -73.1 |
| 11.625 | -82.7 |
| 11.6328125 | -92.5 |
| 11.640625 | -99.3 |
| 11.6484375 | -108.7 |
| 11.65625 | -119.4 |
| 11.6640625 | -120.7 |
| 11.671875 | -114.9 |
| 11.6796875 | -114.3 |
| 11.6875 | -116.7 |
| 11.6953125 | -111.8 |
| 11.703125 | -98.3 |
| 11.7109375 | -81.2 |
| 11.71875 | -69.5 |
| 11.7265625 | -69.4 |
| 11.734375 | -79.5 |
| 11.7421875 | -91.7 |
| 11.75 | -96.9 |
| 11.7578125 | -98.6 |
| 11.765625 | -102.9 |
| 11.7734375 | -106.4 |
| 11.78125 | -109.8 |
| 11.7890625 | -112.6 |
| 11.796875 | -111.4 |
| 11.8046875 | -113.4 |
| 11.8125 | -120.1 |
| 11.8203125 | -126 |
| 11.828125 | -134 |
| 11.8359375 | -141.9 |
| 11.84375 | -143.8 |
| 11.8515625 | -141.6 |
| 11.859375 | -137.2 |
| 11.8671875 | -131.3 |
| 11.875 | -126.2 |
| 11.8828125 | -124.7 |
| 11.890625 | -126.6 |
| 11.8984375 | -122.9 |
| 11.90625 | -112.2 |
| 11.9140625 | -102.6 |
| 11.921875 | -91.8 |
| 11.9296875 | -78.7 |
| 11.9375 | -70.1 |
| 11.9453125 | -58 |
| 11.953125 | -35.9 |
| 11.9609375 | -18 |
| 11.96875 | -7.7 |
| 11.9765625 | 5.8 |
| 11.984375 | 17 |
| 11.9921875 | 20 |
| 12.0 | 23.1 |
| 12.0078125 | 26 |
| 12.015625 | 24.6 |
| 12.0234375 | 25.3 |
| 12.03125 | 30.3 |
| 12.0390625 | 38.1 |
| 12.046875 | 51.6 |
| 12.0546875 | 66.6 |
| 12.0625 | 74.7 |
| 12.0703125 | 75.8 |
| 12.078125 | 78 |
| 12.0859375 | 83.5 |
| 12.09375 | 83.2 |
| 12.1015625 | 77.2 |
| 12.109375 | 75 |
| 12.1171875 | 75.9 |
| 12.125 | 80.6 |
| 12.1328125 | 91 |
| 12.140625 | 96 |
| 12.1484375 | 94.7 |
| 12.15625 | 97 |
| 12.1640625 | 99.4 |
| 12.171875 | 97.4 |
| 12.1796875 | 95 |
| 12.1875 | 95.3 |
| 12.1953125 | 99.7 |
| 12.203125 | 101.8 |
| 12.2109375 | 97.5 |
| 12.21875 | 94.3 |
| 12.2265625 | 93.1 |
| 12.234375 | 89 |
| 12.2421875 | 84 |
| 12.25 | 79.4 |
| 12.2578125 | 77.1 |
| 12.265625 | 81.8 |
| 12.2734375 | 87.6 |
| 12.28125 | 86.3 |
| 12.2890625 | 81.4 |
| 12.296875 | 78.2 |
| 12.3046875 | 75 |
| 12.3125 | 71.5 |
| 12.3203125 | 67.1 |
| 12.328125 | 58.1 |
| 12.3359375 | 51.9 |
| 12.34375 | 56.6 |
| 12.3515625 | 62.3 |
| 12.359375 | 61.6 |
| 12.3671875 | 60.9 |
| 12.375 | 60.9 |
| 12.3828125 | 58.2 |
| 12.390625 | 51 |
| 12.3984375 | 40.9 |
| 12.40625 | 35.5 |
| 12.4140625 | 37.6 |
| 12.421875 | 40 |
| 12.4296875 | 39.8 |
| 12.4375 | 39.7 |
| 12.4453125 | 40.9 |
| 12.453125 | 41.8 |
| 12.4609375 | 38 |
| 12.46875 | 31.2 |
| 12.4765625 | 29.7 |
| 12.484375 | 30.9 |
| 12.4921875 | 26 |
| 12.5 | 19.9 |
| 12.5078125 | 19.5 |
| 12.515625 | 18.5 |
| 12.5234375 | 13.8 |
| 12.53125 | 8.8 |
| 12.5390625 | 4.2 |
| 12.546875 | -1.3 |
| 12.5546875 | -7.9 |
| 12.5625 | -14.4 |
| 12.5703125 | -18.8 |
| 12.578125 | -20.7 |
| 12.5859375 | -20.4 |
| 12.59375 | -17.8 |
| 12.6015625 | -15.9 |
| 12.609375 | -17 |
| 12.6171875 | -19.5 |
| 12.625 | -19.4 |
| 12.6328125 | -15.8 |
| 12.640625 | -15.3 |
| 12.6484375 | -24.7 |
| 12.65625 | -35.6 |
| 12.6640625 | -36.4 |
| 12.671875 | -36.2 |
| 12.6796875 | -42 |
| 12.6875 | -44.5 |
| 12.6953125 | -43.4 |
| 12.703125 | -43.6 |
| 12.7109375 | -41.5 |
| 12.71875 | -36.6 |
| 12.7265625 | -31.1 |
| 12.734375 | -27.5 |
| 12.7421875 | -25.2 |
| 12.75 | -18.7 |
| 12.7578125 | -14.9 |
| 12.765625 | -18.6 |
| 12.7734375 | -19.7 |
| 12.78125 | -20.6 |
| 12.7890625 | -24.8 |
| 12.796875 | -27.7 |
| 12.8046875 | -33.8 |
| 12.8125 | -36.3 |
| 12.8203125 | -28 |
| 12.828125 | -23.3 |
| 12.8359375 | -20.6 |
| 12.84375 | -14.8 |
| 12.8515625 | -15 |
| 12.859375 | -16 |
| 12.8671875 | -16.4 |
| 12.875 | -21.7 |
| 12.8828125 | -24.7 |
| 12.890625 | -32.5 |
| 12.8984375 | -47.3 |
| 12.90625 | -51.8 |
| 12.9140625 | -54.3 |
| 12.921875 | -58.7 |
| 12.9296875 | -49.1 |
| 12.9375 | -38.3 |
| 12.9453125 | -38.5 |
| 12.953125 | -40.8 |
| 12.9609375 | -45 |
| 12.96875 | -45.9 |
| 12.9765625 | -40.6 |
| 12.984375 | -41.1 |
| 12.9921875 | -44.8 |
| 13.0 | -45.8 |
| 13.0078125 | -53.4 |
| 13.015625 | -62.9 |
| 13.0234375 | -62.1 |
| 13.03125 | -59.2 |
| 13.0390625 | -63.6 |
| 13.046875 | -68.3 |
| 13.0546875 | -66.9 |
| 13.0625 | -62.3 |
| 13.0703125 | -58.3 |
| 13.078125 | -53.3 |
| 13.0859375 | -45.3 |
| 13.09375 | -39.5 |
| 13.1015625 | -40.2 |
| 13.109375 | -39.1 |
| 13.1171875 | -33 |
| 13.125 | -29.2 |
| 13.1328125 | -27.1 |
| 13.140625 | -24.8 |
| 13.1484375 | -22 |
| 13.15625 | -14.6 |
| 13.1640625 | -6.7 |
| 13.171875 | -4.3 |
| 13.1796875 | -5 |
| 13.1875 | -5.6 |
| 13.1953125 | -3.5 |
| 13.203125 | -2 |
| 13.2109375 | -5.6 |
| 13.21875 | -6.8 |
| 13.2265625 | -4.1 |
| 13.234375 | -6.7 |
| 13.2421875 | -11.9 |
| 13.25 | -12.6 |
| 13.2578125 | -8.7 |
| 13.265625 | -1.3 |
| 13.2734375 | 5.9 |
| 13.28125 | 11.4 |
| 13.2890625 | 20.6 |
| 13.296875 | 32.2 |
| 13.3046875 | 38.4 |
| 13.3125 | 39.3 |
| 13.3203125 | 39.3 |
| 13.328125 | 38.4 |
| 13.3359375 | 37.5 |
| 13.34375 | 37.5 |
| 13.3515625 | 35.1 |
| 13.359375 | 30.8 |
| 13.3671875 | 28.4 |
| 13.375 | 26.7 |
| 13.3828125 | 24 |
| 13.390625 | 19.4 |
| 13.3984375 | 9.7 |
| 13.40625 | 0.5 |
| 13.4140625 | 0.6 |
| 13.421875 | -0.7 |
| 13.4296875 | -11.5 |
| 13.4375 | -18.4 |
| 13.4453125 | -18.1 |
| 13.453125 | -19.9 |
| 13.4609375 | -22.7 |
| 13.46875 | -24.7 |
| 13.4765625 | -24.6 |
| 13.484375 | -20.1 |
| 13.4921875 | -17.7 |
| 13.5 | -19.9 |
| 13.5078125 | -23.4 |
| 13.515625 | -26.8 |
| 13.5234375 | -28.1 |
| 13.53125 | -26.8 |
| 13.5390625 | -22.6 |
| 13.546875 | -14.9 |
| 13.5546875 | -9.6 |
| 13.5625 | -4.9 |
| 13.5703125 | 5.1 |
| 13.578125 | 15 |
| 13.5859375 | 20.1 |
| 13.59375 | 20.7 |
| 13.6015625 | 17.3 |
| 13.609375 | 15.4 |
| 13.6171875 | 17.9 |
| 13.625 | 20.6 |
| 13.6328125 | 19.7 |
| 13.640625 | 14.5 |
| 13.6484375 | 10.3 |
| 13.65625 | 11.7 |
| 13.6640625 | 14.5 |
| 13.671875 | 14.4 |
| 13.6796875 | 12.6 |
| 13.6875 | 15.5 |
| 13.6953125 | 23.1 |
| 13.703125 | 25.4 |
| 13.7109375 | 24.1 |
| 13.71875 | 26.6 |
| 13.7265625 | 25.9 |
| 13.734375 | 21.9 |
| 13.7421875 | 22.5 |
| 13.75 | 26.2 |
| 13.7578125 | 32.3 |
| 13.765625 | 40.3 |
| 13.7734375 | 44 |
| 13.78125 | 43.8 |
| 13.7890625 | 40.1 |
| 13.796875 | 33.6 |
| 13.8046875 | 30.7 |
| 13.8125 | 30.7 |
| 13.8203125 | 29.4 |
| 13.828125 | 26.1 |
| 13.8359375 | 19.3 |
| 13.84375 | 14.6 |
| 13.8515625 | 12.7 |
| 13.859375 | 7.1 |
| 13.8671875 | 6.3 |
| 13.875 | 12.5 |
| 13.8828125 | 11 |
| 13.890625 | 9.1 |
| 13.8984375 | 17 |
| 13.90625 | 21.5 |
| 13.9140625 | 18.7 |
| 13.921875 | 17.5 |
| 13.9296875 | 16.8 |
| 13.9375 | 15.1 |
| 13.9453125 | 13 |
| 13.953125 | 9.5 |
| 13.9609375 | 9.1 |
| 13.96875 | 9.3 |
| 13.9765625 | 3.2 |
| 13.984375 | -2.1 |
| 13.9921875 | -3.5 |
| 14.0 | -8.9 |
| 14.0078125 | -14.7 |
| 14.015625 | -17.1 |
| 14.0234375 | -22.5 |
| 14.03125 | -27.9 |
| 14.0390625 | -31.1 |
| 14.046875 | -38.2 |
| 14.0546875 | -41.4 |
| 14.0625 | -32.2 |
| 14.0703125 | -22.2 |
| 14.078125 | -19.4 |
| 14.0859375 | -19.2 |
| 14.09375 | -21.5 |
| 14.1015625 | -25.8 |
| 14.109375 | -22.8 |
| 14.1171875 | -16 |
| 14.125 | -19.1 |
| 14.1328125 | -25.5 |
| 14.140625 | -25.5 |
| 14.1484375 | -27 |
| 14.15625 | -30.3 |
| 14.1640625 | -29.4 |
| 14.171875 | -27 |
| 14.1796875 | -26.2 |
| 14.1875 | -31.3 |
| 14.1953125 | -39.7 |
| 14.203125 | -41.4 |
| 14.2109375 | -38.8 |
| 14.21875 | -35.2 |
| 14.2265625 | -27.7 |
| 14.234375 | -19.3 |
| 14.2421875 | -12.8 |
| 14.25 | -10.1 |
| 14.2578125 | -8.2 |
| 14.265625 | -0.4 |
| 14.2734375 | 3.2 |
| 14.28125 | 0.9 |
| 14.2890625 | 6.3 |
| 14.296875 | 9.3 |
| 14.3046875 | 2.6 |
| 14.3125 | 3.1 |
| 14.3203125 | 8.8 |
| 14.328125 | 8 |
| 14.3359375 | 4.8 |
| 14.34375 | 2.3 |
| 14.3515625 | -0.8 |
| 14.359375 | -3.2 |
| 14.3671875 | -2.5 |
| 14.375 | 2.8 |
| 14.3828125 | 4.8 |
| 14.390625 | 1 |
| 14.3984375 | 2.1 |
| 14.40625 | 6.7 |
| 14.4140625 | 4.9 |
| 14.421875 | 1.8 |
| 14.4296875 | 1.9 |
| 14.4375 | -2.2 |
| 14.4453125 | -8.1 |
| 14.453125 | -8.7 |
| 14.4609375 | -9.7 |
| 14.46875 | -13.2 |
| 14.4765625 | -14.1 |
| 14.484375 | -14.5 |
| 14.4921875 | -17.5 |
| 14.5 | -21.5 |
| 14.5078125 | -21.5 |
| 14.515625 | -15 |
| 14.5234375 | -12.1 |
| 14.53125 | -18.1 |
| 14.5390625 | -22.4 |
| 14.546875 | -25 |
| 14.5546875 | -31.7 |
| 14.5625 | -33 |
| 14.5703125 | -28.5 |
| 14.578125 | -26.1 |
| 14.5859375 | -18.8 |
| 14.59375 | -6 |
| 14.6015625 | -4.2 |
| 14.609375 | -11.8 |
| 14.6171875 | -13.8 |
| 14.625 | -14 |
| 14.6328125 | -15.6 |
| 14.640625 | -10 |
| 14.6484375 | -2.1 |
| 14.65625 | -1.3 |
| 14.6640625 | -5.6 |
| 14.671875 | -12.2 |
| 14.6796875 | -15 |
| 14.6875 | -10.8 |
| 14.6953125 | -6.4 |
| 14.703125 | -1.4 |
| 14.7109375 | 5.7 |
| 14.71875 | 9.7 |
| 14.7265625 | 13 |
| 14.734375 | 17.2 |
| 14.7421875 | 17.3 |
| 14.75 | 13.6 |
| 14.7578125 | 11.3 |
| 14.765625 | 14.2 |
| 14.7734375 | 18 |
| 14.78125 | 16 |
| 14.7890625 | 18.2 |
| 14.796875 | 29.8 |
| 14.8046875 | 38.7 |
| 14.8125 | 41.2 |
| 14.8203125 | 39.4 |
| 14.828125 | 36 |
| 14.8359375 | 35.3 |
| 14.84375 | 29.1 |
| 14.8515625 | 18.5 |
| 14.859375 | 19.5 |
| 14.8671875 | 24 |
| 14.875 | 20.7 |
| 14.8828125 | 19.1 |
| 14.890625 | 18.3 |
| 14.8984375 | 16.7 |
| 14.90625 | 21.3 |
| 14.9140625 | 28.3 |
| 14.921875 | 33.2 |
| 14.9296875 | 35.3 |
| 14.9375 | 33.4 |
| 14.9453125 | 33.5 |
| 14.953125 | 33.7 |
| 14.9609375 | 31 |
| 14.96875 | 33.6 |
| 14.9765625 | 38.8 |
| 14.984375 | 40.5 |
| 14.9921875 | 41.7 |
| 15.0 | 41 |
| 15.0078125 | 39.7 |
| 15.015625 | 41.1 |
| 15.0234375 | 42.1 |
| 15.03125 | 43 |
| 15.0390625 | 43.6 |
| 15.046875 | 43.1 |
| 15.0546875 | 44 |
| 15.0625 | 41.4 |
| 15.0703125 | 37.4 |
| 15.078125 | 41.3 |
| 15.0859375 | 43.7 |
| 15.09375 | 36.7 |
| 15.1015625 | 29.4 |
| 15.109375 | 24.9 |
| 15.1171875 | 21.4 |
| 15.125 | 19.2 |
| 15.1328125 | 17.9 |
| 15.140625 | 20.7 |
| 15.1484375 | 22.7 |
| 15.15625 | 16.5 |
| 15.1640625 | 12.4 |
| 15.171875 | 14.5 |
| 15.1796875 | 12.4 |
| 15.1875 | 9.8 |
| 15.1953125 | 9.7 |
| 15.203125 | 5.9 |
| 15.2109375 | 6.2 |
| 15.21875 | 13 |
| 15.2265625 | 14.4 |
| 15.234375 | 11.6 |
| 15.2421875 | 9.9 |
| 15.25 | 8.5 |
| 15.2578125 | 9.7 |
| 15.265625 | 10 |
| 15.2734375 | 6.3 |
| 15.28125 | 5.7 |
| 15.2890625 | 9.3 |
| 15.296875 | 13.1 |
| 15.3046875 | 15.6 |
| 15.3125 | 15 |
| 15.3203125 | 15.8 |
| 15.328125 | 17.3 |
| 15.3359375 | 13.2 |
| 15.34375 | 11.9 |
| 15.3515625 | 13.1 |
| 15.359375 | 3.4 |
| 15.3671875 | -5.8 |
| 15.375 | -3 |
| 15.3828125 | -1.6 |
| 15.390625 | -6.6 |
| 15.3984375 | -8.4 |
| 15.40625 | -3.9 |
| 15.4140625 | 0.6 |
| 15.421875 | -1.9 |
| 15.4296875 | -6.5 |
| 15.4375 | -7.1 |
| 15.4453125 | -8.7 |
| 15.453125 | -8.2 |
| 15.4609375 | 0.9 |
| 15.46875 | 8.1 |
| 15.4765625 | 3.6 |
| 15.484375 | -1.9 |
| 15.4921875 | 3.1 |
| 15.5 | 11 |
| 15.5078125 | 10.3 |
| 15.515625 | 6.8 |
| 15.5234375 | 9.3 |
| 15.53125 | 14.9 |
| 15.5390625 | 18.5 |
| 15.546875 | 18.1 |
| 15.5546875 | 12.7 |
| 15.5625 | 5.4 |
| 15.5703125 | 3.4 |
| 15.578125 | 5.8 |
| 15.5859375 | 6 |
| 15.59375 | 8 |
| 15.6015625 | 13.8 |
| 15.609375 | 15.9 |
| 15.6171875 | 17.9 |
| 15.625 | 20.6 |
| 15.6328125 | 15.8 |
| 15.640625 | 9.9 |
| 15.6484375 | 5.9 |
| 15.65625 | -0.9 |
| 15.6640625 | -1 |
| 15.671875 | 5.2 |
| 15.6796875 | 5 |
| 15.6875 | 2.5 |
| 15.6953125 | 1.4 |
| 15.703125 | -2.3 |
| 15.7109375 | -5.2 |
| 15.71875 | -5.9 |
| 15.7265625 | -5.7 |
| 15.734375 | -4.3 |
| 15.7421875 | -6.7 |
| 15.75 | -13.5 |
| 15.7578125 | -16.3 |
| 15.765625 | -13.5 |
| 15.7734375 | -14.4 |
| 15.78125 | -23.3 |
| 15.7890625 | -34.1 |
| 15.796875 | -41.6 |
| 15.8046875 | -44.8 |
| 15.8125 | -46.7 |
| 15.8203125 | -53 |
| 15.828125 | -58.1 |
| 15.8359375 | -51.7 |
| 15.84375 | -41.7 |
| 15.8515625 | -37.6 |
| 15.859375 | -35.9 |
| 15.8671875 | -36 |
| 15.875 | -36.7 |
| 15.8828125 | -34.1 |
| 15.890625 | -33.2 |
| 15.8984375 | -34.6 |
| 15.90625 | -32.2 |
| 15.9140625 | -32.3 |
| 15.921875 | -40.5 |
| 15.9296875 | -45.4 |
| 15.9375 | -43 |
| 15.9453125 | -43.8 |
| 15.953125 | -44.8 |
| 15.9609375 | -37.1 |
| 15.96875 | -31.9 |
| 15.9765625 | -34.3 |
| 15.984375 | -32.2 |
| 15.9921875 | -27.1 |
| 16.0 | -27.4 |
| 16.0078125 | -28.2 |
| 16.015625 | -24.6 |
| 16.0234375 | -15.4 |
| 16.03125 | -5.4 |
| 16.0390625 | -1.1 |
| 16.046875 | 2.5 |
| 16.0546875 | 6.9 |
| 16.0625 | 5.8 |
| 16.0703125 | 2.3 |
| 16.078125 | 1 |
| 16.0859375 | 2.7 |
| 16.09375 | 10.3 |
| 16.1015625 | 18 |
| 16.109375 | 17.3 |
| 16.1171875 | 11.5 |
| 16.125 | 9.8 |
| 16.1328125 | 15.5 |
| 16.140625 | 21.2 |
| 16.1484375 | 22.4 |
| 16.15625 | 24.7 |
| 16.1640625 | 26.9 |
| 16.171875 | 25.2 |
| 16.1796875 | 22.9 |
| 16.1875 | 20 |
| 16.1953125 | 13.2 |
| 16.203125 | 0.3 |
| 16.2109375 | -16.4 |
| 16.21875 | -26.9 |
| 16.2265625 | -26.5 |
| 16.234375 | -22.5 |
| 16.2421875 | -23.8 |
| 16.25 | -29.5 |
| 16.2578125 | -29.7 |
| 16.265625 | -24.4 |
| 16.2734375 | -22.9 |
| 16.28125 | -21.3 |
| 16.2890625 | -15.1 |
| 16.296875 | -9 |
| 16.3046875 | -3.6 |
| 16.3125 | 5.1 |
| 16.3203125 | 18.8 |
| 16.328125 | 31.8 |
| 16.3359375 | 39.9 |
| 16.34375 | 50.6 |
| 16.3515625 | 59.7 |
| 16.359375 | 54.2 |
| 16.3671875 | 42.3 |
| 16.375 | 31.5 |
| 16.3828125 | 18.7 |
| 16.390625 | 11.4 |
| 16.3984375 | 9.4 |
| 16.40625 | 0.4 |
| 16.4140625 | -10.4 |
| 16.421875 | -15.8 |
| 16.4296875 | -23.9 |
| 16.4375 | -35.3 |
| 16.4453125 | -46 |
| 16.453125 | -55.9 |
| 16.4609375 | -57.5 |
| 16.46875 | -51.4 |
| 16.4765625 | -49.9 |
| 16.484375 | -49.7 |
| 16.4921875 | -43.1 |
| 16.5 | -32.9 |
| 16.5078125 | -20.7 |
| 16.515625 | -13.1 |
| 16.5234375 | -13.3 |
| 16.53125 | -8.7 |
| 16.5390625 | 2.9 |
| 16.546875 | 11.4 |
| 16.5546875 | 10.7 |
| 16.5625 | -0.3 |
| 16.5703125 | -11.1 |
| 16.578125 | -17.8 |
| 16.5859375 | -29.3 |
| 16.59375 | -41.1 |
| 16.6015625 | -46.1 |
| 16.609375 | -45.8 |
| 16.6171875 | -41.6 |
| 16.625 | -39.5 |
| 16.6328125 | -37.7 |
| 16.640625 | -28.9 |
| 16.6484375 | -21.4 |
| 16.65625 | -20.3 |
| 16.6640625 | -22.8 |
| 16.671875 | -31.5 |
| 16.6796875 | -36.5 |
| 16.6875 | -32.4 |
| 16.6953125 | -32.7 |
| 16.703125 | -35.7 |
| 16.7109375 | -34.6 |
| 16.71875 | -35.4 |
| 16.7265625 | -34.6 |
| 16.734375 | -31.3 |
| 16.7421875 | -35.8 |
| 16.75 | -43.6 |
| 16.7578125 | -44.5 |
| 16.765625 | -37.5 |
| 16.7734375 | -25.2 |
| 16.78125 | -12.8 |
| 16.7890625 | -2 |
| 16.796875 | 8.9 |
| 16.8046875 | 18.6 |
| 16.8125 | 28.7 |
| 16.8203125 | 35.5 |
| 16.828125 | 27.8 |
| 16.8359375 | 9.5 |
| 16.84375 | -5 |
| 16.8515625 | -8 |
| 16.859375 | 0.1 |
| 16.8671875 | 11.2 |
| 16.875 | 24.6 |
| 16.8828125 | 40.8 |
| 16.890625 | 47.5 |
| 16.8984375 | 42.6 |
| 16.90625 | 35.2 |
| 16.9140625 | 30.2 |
| 16.921875 | 33.7 |
| 16.9296875 | 40.5 |
| 16.9375 | 42.3 |
| 16.9453125 | 50.5 |
| 16.953125 | 64.4 |
| 16.9609375 | 70.6 |
| 16.96875 | 73.2 |
| 16.9765625 | 71.4 |
| 16.984375 | 57.4 |
| 16.9921875 | 40.8 |
| 17.0 | 29.8 |
| 17.0078125 | 20.1 |
| 17.015625 | 11.2 |
| 17.0234375 | 5.8 |
| 17.03125 | 4.7 |
| 17.0390625 | 8.8 |
| 17.046875 | 15.3 |
| 17.0546875 | 17.5 |
| 17.0625 | 12.5 |
| 17.0703125 | 4.6 |
| 17.078125 | -1.8 |
| 17.0859375 | -5 |
| 17.09375 | -4 |
| 17.1015625 | 6.2 |
| 17.109375 | 28.1 |
| 17.1171875 | 46.2 |
| 17.125 | 44.8 |
| 17.1328125 | 31.8 |
| 17.140625 | 17.1 |
| 17.1484375 | 3.9 |
| 17.15625 | -2 |
| 17.1640625 | -2.3 |
| 17.171875 | -3.2 |
| 17.1796875 | -0.7 |
| 17.1875 | 7.4 |
| 17.1953125 | 12.8 |
| 17.203125 | 10.6 |
| 17.2109375 | 7.5 |
| 17.21875 | 6.7 |
| 17.2265625 | 3.8 |
| 17.234375 | 2.5 |
| 17.2421875 | 5.8 |
| 17.25 | 8.8 |
| 17.2578125 | 14.4 |
| 17.265625 | 26.3 |
| 17.2734375 | 37.3 |
| 17.28125 | 40.9 |
| 17.2890625 | 38.3 |
| 17.296875 | 35.2 |
| 17.3046875 | 31.4 |
| 17.3125 | 24.6 |
| 17.3203125 | 22.1 |
| 17.328125 | 22 |
| 17.3359375 | 16.4 |
| 17.34375 | 12 |
| 17.3515625 | 11.7 |
| 17.359375 | 9 |
| 17.3671875 | 0.2 |
| 17.375 | -16.4 |
| 17.3828125 | -29.1 |
| 17.390625 | -32.4 |
| 17.3984375 | -39.2 |
| 17.40625 | -42.1 |
| 17.4140625 | -29.1 |
| 17.421875 | -11.7 |
| 17.4296875 | 3.3 |
| 17.4375 | 13.8 |
| 17.4453125 | 16.6 |
| 17.453125 | 18.4 |
| 17.4609375 | 18.5 |
| 17.46875 | 13.5 |
| 17.4765625 | 12.2 |
| 17.484375 | 19.2 |
| 17.4921875 | 30.6 |
| 17.5 | 38.2 |
| 17.5078125 | 38.2 |
| 17.515625 | 38.9 |
| 17.5234375 | 37.8 |
| 17.53125 | 26.5 |
| 17.5390625 | 12.7 |
| 17.546875 | 1.4 |
| 17.5546875 | -8 |
| 17.5625 | -8.7 |
| 17.5703125 | 1 |
| 17.578125 | 15.7 |
| 17.5859375 | 31.2 |
| 17.59375 | 41.3 |
| 17.6015625 | 39.7 |
| 17.609375 | 26.9 |
| 17.6171875 | 11.6 |
| 17.625 | 0.7 |
| 17.6328125 | -3.8 |
| 17.640625 | 0.1 |
| 17.6484375 | 9.9 |
| 17.65625 | 16.4 |
| 17.6640625 | 15.3 |
| 17.671875 | 7.1 |
| 17.6796875 | -8.1 |
| 17.6875 | -24 |
| 17.6953125 | -29.9 |
| 17.703125 | -26.6 |
| 17.7109375 | -22.7 |
| 17.71875 | -17.3 |
| 17.7265625 | -10.7 |
| 17.734375 | -5.3 |
| 17.7421875 | 2.9 |
| 17.75 | 7.2 |
| 17.7578125 | -1.1 |
| 17.765625 | -10.4 |
| 17.7734375 | -13.9 |
| 17.78125 | -17.9 |
| 17.7890625 | -18.1 |
| 17.796875 | -14.6 |
| 17.8046875 | -15.8 |
| 17.8125 | -18.9 |
| 17.8203125 | -22.8 |
| 17.828125 | -31.7 |
| 17.8359375 | -38.1 |
| 17.84375 | -36.2 |
| 17.8515625 | -33.5 |
| 17.859375 | -29.3 |
| 17.8671875 | -19.4 |
| 17.875 | -10 |
| 17.8828125 | -2.8 |
| 17.890625 | 8.1 |
| 17.8984375 | 19.1 |
| 17.90625 | 20.4 |
| 17.9140625 | 10.2 |
| 17.921875 | -5 |
| 17.9296875 | -15.6 |
| 17.9375 | -16.6 |
| 17.9453125 | -14.1 |
| 17.953125 | -14.5 |
| 17.9609375 | -18 |
| 17.96875 | -26.2 |
| 17.9765625 | -41.6 |
| 17.984375 | -57.6 |
| 17.9921875 | -67.4 |
| 18.0 | -71.3 |
| 18.0078125 | -72.3 |
| 18.015625 | -71.5 |
| 18.0234375 | -65 |
| 18.03125 | -53.8 |
| 18.0390625 | -48 |
| 18.046875 | -45.2 |
| 18.0546875 | -37.4 |
| 18.0625 | -31.4 |
| 18.0703125 | -29.1 |
| 18.078125 | -22.6 |
| 18.0859375 | -11.5 |
| 18.09375 | 1.8 |
| 18.1015625 | 11.8 |
| 18.109375 | 11.2 |
| 18.1171875 | 6.5 |
| 18.125 | 7.2 |
| 18.1328125 | 7.4 |
| 18.140625 | 2.8 |
| 18.1484375 | 1.6 |
| 18.15625 | 7.5 |
| 18.1640625 | 14.9 |
| 18.171875 | 21 |
| 18.1796875 | 27.1 |
| 18.1875 | 33.7 |
| 18.1953125 | 37.4 |
| 18.203125 | 33.6 |
| 18.2109375 | 25.6 |
| 18.21875 | 18.3 |
| 18.2265625 | 10 |
| 18.234375 | 3.6 |
| 18.2421875 | 2.6 |
| 18.25 | 0.4 |
| 18.2578125 | -5.4 |
| 18.265625 | -10.2 |
| 18.2734375 | -15.6 |
| 18.28125 | -26.4 |
| 18.2890625 | -41.3 |
| 18.296875 | -51.5 |
| 18.3046875 | -51.9 |
| 18.3125 | -47.5 |
| 18.3203125 | -41.5 |
| 18.328125 | -35.1 |
| 18.3359375 | -32.7 |
| 18.34375 | -31.5 |
| 18.3515625 | -28.1 |
| 18.359375 | -28.9 |
| 18.3671875 | -35.4 |
| 18.375 | -42.4 |
| 18.3828125 | -47 |
| 18.390625 | -45.1 |
| 18.3984375 | -38.8 |
| 18.40625 | -38.3 |
| 18.4140625 | -44.8 |
| 18.421875 | -50.7 |
| 18.4296875 | -55.5 |
| 18.4375 | -64.4 |
| 18.4453125 | -71.8 |
| 18.453125 | -67.3 |
| 18.4609375 | -58.2 |
| 18.46875 | -53.2 |
| 18.4765625 | -43.5 |
| 18.484375 | -29.1 |
| 18.4921875 | -19.1 |
| 18.5 | -12.8 |
| 18.5078125 | -11.3 |
| 18.515625 | -13.1 |
| 18.5234375 | -10.9 |
| 18.53125 | -7.1 |
| 18.5390625 | -2.9 |
| 18.546875 | 5.1 |
| 18.5546875 | 10 |
| 18.5625 | 8.4 |
| 18.5703125 | 5.8 |
| 18.578125 | 4.6 |
| 18.5859375 | 5.1 |
| 18.59375 | 6.4 |
| 18.6015625 | 9.8 |
| 18.609375 | 17.8 |
| 18.6171875 | 21.2 |
| 18.625 | 18.7 |
| 18.6328125 | 25.2 |
| 18.640625 | 35.4 |
| 18.6484375 | 35.7 |
| 18.65625 | 35.7 |
| 18.6640625 | 38.1 |
| 18.671875 | 36.4 |
| 18.6796875 | 39.4 |
| 18.6875 | 47.3 |
| 18.6953125 | 53.2 |
| 18.703125 | 59.3 |
| 18.7109375 | 58.7 |
| 18.71875 | 51.5 |
| 18.7265625 | 48.7 |
| 18.734375 | 45.1 |
| 18.7421875 | 41.1 |
| 18.75 | 43.4 |
| 18.7578125 | 41.7 |
| 18.765625 | 39.5 |
| 18.7734375 | 48.6 |
| 18.78125 | 57.1 |
| 18.7890625 | 56.9 |
| 18.796875 | 54.1 |
| 18.8046875 | 49 |
| 18.8125 | 44.9 |
| 18.8203125 | 44 |
| 18.828125 | 42.4 |
| 18.8359375 | 44 |
| 18.84375 | 45.9 |
| 18.8515625 | 38.7 |
| 18.859375 | 28.8 |
| 18.8671875 | 22 |
| 18.875 | 15.9 |
| 18.8828125 | 11.4 |
| 18.890625 | 5.8 |
| 18.8984375 | 0.9 |
| 18.90625 | 3.4 |
| 18.9140625 | 9.3 |
| 18.921875 | 17.1 |
| 18.9296875 | 25.7 |
| 18.9375 | 28.3 |
| 18.9453125 | 32.3 |
| 18.953125 | 40.2 |
| 18.9609375 | 44.6 |
| 18.96875 | 50.5 |
| 18.9765625 | 53.9 |
| 18.984375 | 48.2 |
| 18.9921875 | 46.3 |
| 19.0 | 44.9 |
| 19.0078125 | 33.5 |
| 19.015625 | 27.5 |
| 19.0234375 | 31.7 |
| 19.03125 | 32.3 |
| 19.0390625 | 29.1 |
| 19.046875 | 28.4 |
| 19.0546875 | 31.9 |
| 19.0625 | 35.8 |
| 19.0703125 | 37 |
| 19.078125 | 44.9 |
| 19.0859375 | 59.2 |
| 19.09375 | 63.1 |
| 19.1015625 | 58.4 |
| 19.109375 | 59.4 |
| 19.1171875 | 63 |
| 19.125 | 60.4 |
| 19.1328125 | 52.1 |
| 19.140625 | 41.7 |
| 19.1484375 | 34.3 |
| 19.15625 | 32.3 |
| 19.1640625 | 31.3 |
| 19.171875 | 24.5 |
| 19.1796875 | 16.7 |
| 19.1875 | 16.3 |
| 19.1953125 | 15.1 |
| 19.203125 | 8.9 |
| 19.2109375 | 13.3 |
| 19.21875 | 21.9 |
| 19.2265625 | 16.7 |
| 19.234375 | 13 |
| 19.2421875 | 18.8 |
| 19.25 | 15.6 |
| 19.2578125 | 5.3 |
| 19.265625 | -2.4 |
| 19.2734375 | -11.5 |
| 19.28125 | -17.7 |
| 19.2890625 | -17.7 |
| 19.296875 | -20.7 |
| 19.3046875 | -26.3 |
| 19.3125 | -25.5 |
| 19.3203125 | -17.4 |
| 19.328125 | -7.2 |
| 19.3359375 | 0.5 |
| 19.34375 | 4.3 |
| 19.3515625 | 5.4 |
| 19.359375 | 5.2 |
| 19.3671875 | 3.6 |
| 19.375 | -0.5 |
| 19.3828125 | -4.9 |
| 19.390625 | -4.6 |
| 19.3984375 | -2.3 |
| 19.40625 | -4.6 |
| 19.4140625 | -6.4 |
| 19.421875 | -5.4 |
| 19.4296875 | -7.9 |
| 19.4375 | -8.3 |
| 19.4453125 | 1.2 |
| 19.453125 | 10.4 |
| 19.4609375 | 9.8 |
| 19.46875 | 4.1 |
| 19.4765625 | 1.3 |
| 19.484375 | 2.1 |
| 19.4921875 | 1.9 |
| 19.5 | 1.1 |
| 19.5078125 | 0.4 |
| 19.515625 | -3.6 |
| 19.5234375 | -8.5 |
| 19.53125 | -7.7 |
| 19.5390625 | -1.2 |
| 19.546875 | 2.2 |
| 19.5546875 | -3.9 |
| 19.5625 | -13 |
| 19.5703125 | -17.3 |
| 19.578125 | -20 |
| 19.5859375 | -21.1 |
| 19.59375 | -20.9 |
| 19.6015625 | -27.2 |
| 19.609375 | -38.9 |
| 19.6171875 | -45.6 |
| 19.625 | -49.9 |
| 19.6328125 | -58.6 |
| 19.640625 | -65.6 |
| 19.6484375 | -67.1 |
| 19.65625 | -71.2 |
| 19.6640625 | -80.9 |
| 19.671875 | -87.4 |
| 19.6796875 | -88.4 |
| 19.6875 | -91.3 |
| 19.6953125 | -96.8 |
| 19.703125 | -100.9 |
| 19.7109375 | -106.8 |
| 19.71875 | -112.8 |
| 19.7265625 | -112 |
| 19.734375 | -108.1 |
| 19.7421875 | -105 |
| 19.75 | -101 |
| 19.7578125 | -97.4 |
| 19.765625 | -89.3 |
| 19.7734375 | -72.6 |
| 19.78125 | -55.7 |
| 19.7890625 | -42.8 |
| 19.796875 | -30 |
| 19.8046875 | -17.7 |
| 19.8125 | -10.1 |
| 19.8203125 | -9.4 |
| 19.828125 | -9 |
| 19.8359375 | -9 |
| 19.84375 | -19.7 |
| 19.8515625 | -31 |
| 19.859375 | -28.7 |
| 19.8671875 | -25 |
| 19.875 | -27.3 |
| 19.8828125 | -24.5 |
| 19.890625 | -14.3 |
| 19.8984375 | -1.3 |
| 19.90625 | 9.5 |
| 19.9140625 | 12.9 |
| 19.921875 | 11.9 |
| 19.9296875 | 12.8 |
| 19.9375 | 13.7 |
| 19.9453125 | 12.4 |
| 19.953125 | 12.6 |
| 19.9609375 | 17.4 |
| 19.96875 | 22.3 |
| 19.9765625 | 18.5 |
| 19.984375 | 8.8 |
| 19.9921875 | 4.5 |
| 20.0 | 2.1 |
| 20.0078125 | -6.3 |
| 20.015625 | -10.4 |
| 20.0234375 | -0.8 |
| 20.03125 | 12.1 |
| 20.0390625 | 18.2 |
| 20.046875 | 20.7 |
| 20.0546875 | 23.8 |
| 20.0625 | 27.8 |
| 20.0703125 | 31.2 |
| 20.078125 | 31.1 |
| 20.0859375 | 30.6 |
| 20.09375 | 35.7 |
| 20.1015625 | 43 |
| 20.109375 | 46.8 |
| 20.1171875 | 44.6 |
| 20.125 | 36.1 |
| 20.1328125 | 26.7 |
| 20.140625 | 18.8 |
| 20.1484375 | 8.7 |
| 20.15625 | 1.2 |
| 20.1640625 | -0.7 |
| 20.171875 | -3.4 |
| 20.1796875 | -4.5 |
| 20.1875 | -0.4 |
| 20.1953125 | 1.6 |
| 20.203125 | 0.5 |
| 20.2109375 | 1.9 |
| 20.21875 | 2.5 |
| 20.2265625 | 2.6 |
| 20.234375 | 8.5 |
| 20.2421875 | 15.7 |
| 20.25 | 18 |
| 20.2578125 | 18 |
| 20.265625 | 17.8 |
| 20.2734375 | 18 |
| 20.28125 | 19.5 |
| 20.2890625 | 21.5 |
| 20.296875 | 24 |
| 20.3046875 | 24.3 |
| 20.3125 | 18.4 |
| 20.3203125 | 9 |
| 20.328125 | -0.7 |
| 20.3359375 | -10.1 |
| 20.34375 | -17.3 |
| 20.3515625 | -24.6 |
| 20.359375 | -33.8 |
| 20.3671875 | -39.9 |
| 20.375 | -41.2 |
| 20.3828125 | -41 |
| 20.390625 | -39.9 |
| 20.3984375 | -35.2 |
| 20.40625 | -22.7 |
| 20.4140625 | -7.9 |
| 20.421875 | -1.4 |
| 20.4296875 | 0.5 |
| 20.4375 | 7.6 |
| 20.4453125 | 15.9 |
| 20.453125 | 20.6 |
| 20.4609375 | 22.7 |
| 20.46875 | 19 |
| 20.4765625 | 12.5 |
| 20.484375 | 7.8 |
| 20.4921875 | -1.1 |
| 20.5 | -9.4 |
| 20.5078125 | -7.1 |
| 20.515625 | -2.5 |
| 20.5234375 | 0.4 |
| 20.53125 | 6.3 |
| 20.5390625 | 11.8 |
| 20.546875 | 16.7 |
| 20.5546875 | 20.1 |
| 20.5625 | 15.4 |
| 20.5703125 | 9.4 |
| 20.578125 | 10.5 |
| 20.5859375 | 13.5 |
| 20.59375 | 17 |
| 20.6015625 | 23.2 |
| 20.609375 | 26.8 |
| 20.6171875 | 25.9 |
| 20.625 | 25.6 |
| 20.6328125 | 27.1 |
| 20.640625 | 28.1 |
| 20.6484375 | 32.4 |
| 20.65625 | 38.8 |
| 20.6640625 | 42.2 |
| 20.671875 | 48.3 |
| 20.6796875 | 58.1 |
| 20.6875 | 58.3 |
| 20.6953125 | 49.4 |
| 20.703125 | 42.3 |
| 20.7109375 | 38.2 |
| 20.71875 | 36.9 |
| 20.7265625 | 37.3 |
| 20.734375 | 33.8 |
| 20.7421875 | 27.5 |
| 20.75 | 25.3 |
| 20.7578125 | 26.7 |
| 20.765625 | 23 |
| 20.7734375 | 13.6 |
| 20.78125 | 8.9 |
| 20.7890625 | 7.4 |
| 20.796875 | -1.9 |
| 20.8046875 | -11.6 |
| 20.8125 | -9.2 |
| 20.8203125 | -3 |
| 20.828125 | -2 |
| 20.8359375 | -2.5 |
| 20.84375 | -4.8 |
| 20.8515625 | -9.3 |
| 20.859375 | -10.2 |
| 20.8671875 | -10.5 |
| 20.875 | -13.2 |
| 20.8828125 | -13.2 |
| 20.890625 | -14.1 |
| 20.8984375 | -17.5 |
| 20.90625 | -16.7 |
| 20.9140625 | -17.6 |
| 20.921875 | -20.2 |
| 20.9296875 | -15.8 |
| 20.9375 | -13.7 |
| 20.9453125 | -19 |
| 20.953125 | -21.3 |
| 20.9609375 | -21.4 |
| 20.96875 | -21.9 |
| 20.9765625 | -20.2 |
| 20.984375 | -18.8 |
| 20.9921875 | -15.4 |
| 21.0 | -12.3 |
| 21.0078125 | -17.5 |
| 21.015625 | -24 |
| 21.0234375 | -23.9 |
| 21.03125 | -21.4 |
| 21.0390625 | -16.6 |
| 21.046875 | -10.7 |
| 21.0546875 | -9.2 |
| 21.0625 | -10 |
| 21.0703125 | -9.3 |
| 21.078125 | -9.9 |
| 21.0859375 | -13.3 |
| 21.09375 | -18 |
| 21.1015625 | -21.6 |
| 21.109375 | -22.9 |
| 21.1171875 | -21.1 |
| 21.125 | -16.9 |
| 21.1328125 | -15.4 |
| 21.140625 | -17.8 |
| 21.1484375 | -20.8 |
| 21.15625 | -24.3 |
| 21.1640625 | -25.8 |
| 21.171875 | -22.5 |
| 21.1796875 | -22.2 |
| 21.1875 | -25.6 |
| 21.1953125 | -23 |
| 21.203125 | -15.9 |
| 21.2109375 | -11.4 |
| 21.21875 | -7.2 |
| 21.2265625 | -3.6 |
| 21.234375 | -2.3 |
| 21.2421875 | 2.9 |
| 21.25 | 10.3 |
| 21.2578125 | 11.7 |
| 21.265625 | 12.4 |
| 21.2734375 | 18 |
| 21.28125 | 22.9 |
| 21.2890625 | 27.9 |
| 21.296875 | 36.1 |
| 21.3046875 | 44.8 |
| 21.3125 | 50.3 |
| 21.3203125 | 49 |
| 21.328125 | 43.9 |
| 21.3359375 | 40.4 |
| 21.34375 | 34.5 |
| 21.3515625 | 27.2 |
| 21.359375 | 24 |
| 21.3671875 | 22 |
| 21.375 | 22.9 |
| 21.3828125 | 26.8 |
| 21.390625 | 25.5 |
| 21.3984375 | 18.5 |
| 21.40625 | 9.1 |
| 21.4140625 | -1.6 |
| 21.421875 | -8.9 |
| 21.4296875 | -11.7 |
| 21.4375 | -10 |
| 21.4453125 | -9.3 |
| 21.453125 | -14.7 |
| 21.4609375 | -17.1 |
| 21.46875 | -15.9 |
| 21.4765625 | -19.2 |
| 21.484375 | -16.4 |
| 21.4921875 | -6.8 |
| 21.5 | -4.3 |
| 21.5078125 | -6.1 |
| 21.515625 | -9.6 |
| 21.5234375 | -17.4 |
| 21.53125 | -21.8 |
| 21.5390625 | -22.7 |
| 21.546875 | -25.3 |
| 21.5546875 | -26.7 |
| 21.5625 | -26.6 |
| 21.5703125 | -27.6 |
| 21.578125 | -31.6 |
| 21.5859375 | -39.4 |
| 21.59375 | -46.2 |
| 21.6015625 | -47.8 |
| 21.609375 | -44.6 |
| 21.6171875 | -40.4 |
| 21.625 | -38.9 |
| 21.6328125 | -35.2 |
| 21.640625 | -26.9 |
| 21.6484375 | -22.5 |
| 21.65625 | -24.2 |
| 21.6640625 | -25.8 |
| 21.671875 | -26.1 |
| 21.6796875 | -26.9 |
| 21.6875 | -28.1 |
| 21.6953125 | -30.6 |
| 21.703125 | -31.8 |
| 21.7109375 | -26 |
| 21.71875 | -15.5 |
| 21.7265625 | -8.8 |
| 21.734375 | -7 |
| 21.7421875 | -7.6 |
| 21.75 | -7.8 |
| 21.7578125 | -2.3 |
| 21.765625 | 5.1 |
| 21.7734375 | 9.3 |
| 21.78125 | 17 |
| 21.7890625 | 25.8 |
| 21.796875 | 26.1 |
| 21.8046875 | 23.6 |
| 21.8125 | 26.4 |
| 21.8203125 | 35.2 |
| 21.828125 | 46.9 |
| 21.8359375 | 50.6 |
| 21.84375 | 42.4 |
| 21.8515625 | 33.2 |
| 21.859375 | 25.3 |
| 21.8671875 | 15.8 |
| 21.875 | 10 |
| 21.8828125 | 12.4 |
| 21.890625 | 19.9 |
| 21.8984375 | 23.7 |
| 21.90625 | 20.4 |
| 21.9140625 | 16.4 |
| 21.921875 | 11.6 |
| 21.9296875 | 3.4 |
| 21.9375 | -0.4 |
| 21.9453125 | 0.2 |
| 21.953125 | -1.7 |
| 21.9609375 | 1.4 |
| 21.96875 | 12.5 |
| 21.9765625 | 19.5 |
| 21.984375 | 20.2 |
| 21.9921875 | 21.2 |
| 22.0 | 23.7 |
| 22.0078125 | 26 |
| 22.015625 | 28.4 |
| 22.0234375 | 32.4 |
| 22.03125 | 35.7 |
| 22.0390625 | 36.7 |
| 22.046875 | 37.2 |
| 22.0546875 | 31.7 |
| 22.0625 | 19.5 |
| 22.0703125 | 14.2 |
| 22.078125 | 17.3 |
| 22.0859375 | 18.9 |
| 22.09375 | 18 |
| 22.1015625 | 15.1 |
| 22.109375 | 10.9 |
| 22.1171875 | 10.2 |
| 22.125 | 11.9 |
| 22.1328125 | 8.7 |
| 22.140625 | 2.4 |
| 22.1484375 | 3.1 |
| 22.15625 | 8.9 |
| 22.1640625 | 12.3 |
| 22.171875 | 16 |
| 22.1796875 | 18.7 |
| 22.1875 | 16.4 |
| 22.1953125 | 17.7 |
| 22.203125 | 22.6 |
| 22.2109375 | 22.7 |
| 22.21875 | 21.6 |
| 22.2265625 | 22.4 |
| 22.234375 | 22.5 |
| 22.2421875 | 20.6 |
| 22.25 | 14.4 |
| 22.2578125 | 9.2 |
| 22.265625 | 11 |
| 22.2734375 | 12.2 |
| 22.28125 | 7.3 |
| 22.2890625 | 1.8 |
| 22.296875 | -3 |
| 22.3046875 | -5.4 |
| 22.3125 | 0.5 |
| 22.3203125 | 6.6 |
| 22.328125 | 3.3 |
| 22.3359375 | 0.3 |
| 22.34375 | 2 |
| 22.3515625 | -1.4 |
| 22.359375 | -7.3 |
| 22.3671875 | -7.3 |
| 22.375 | -4.5 |
| 22.3828125 | -3 |
| 22.390625 | -1.6 |
| 22.3984375 | 1.5 |
| 22.40625 | 4 |
| 22.4140625 | 4.3 |
| 22.421875 | 3 |
| 22.4296875 | -3 |
| 22.4375 | -10.2 |
| 22.4453125 | -14.2 |
| 22.453125 | -21.8 |
| 22.4609375 | -30.6 |
| 22.46875 | -34.1 |
| 22.4765625 | -38.4 |
| 22.484375 | -39.5 |
| 22.4921875 | -31.1 |
| 22.5 | -25.6 |
| 22.5078125 | -24.5 |
| 22.515625 | -21.1 |
| 22.5234375 | -22.5 |
| 22.53125 | -26.9 |
| 22.5390625 | -24.8 |
| 22.546875 | -21.7 |
| 22.5546875 | -19.1 |
| 22.5625 | -11 |
| 22.5703125 | -4.8 |
| 22.578125 | -4.1 |
| 22.5859375 | 0.5 |
| 22.59375 | 6 |
| 22.6015625 | 4.3 |
| 22.609375 | 0.5 |
| 22.6171875 | -0.5 |
| 22.625 | 1.1 |
| 22.6328125 | 4.4 |
| 22.640625 | 5.4 |
| 22.6484375 | 4.1 |
| 22.65625 | 5.9 |
| 22.6640625 | 8.8 |
| 22.671875 | 7.7 |
| 22.6796875 | 2.3 |
| 22.6875 | -3.3 |
| 22.6953125 | -6.1 |
| 22.703125 | -6.1 |
| 22.7109375 | -3.9 |
| 22.71875 | -1.5 |
| 22.7265625 | 0.3 |
| 22.734375 | 3.4 |
| 22.7421875 | 6.8 |
| 22.75 | 8.6 |
| 22.7578125 | 10.9 |
| 22.765625 | 13.4 |
| 22.7734375 | 12.9 |
| 22.78125 | 5.1 |
| 22.7890625 | -8.3 |
| 22.796875 | -13.2 |
| 22.8046875 | -8.5 |
| 22.8125 | -9.6 |
| 22.8203125 | -13.6 |
| 22.828125 | -10.8 |
| 22.8359375 | -9.3 |
| 22.84375 | -12.2 |
| 22.8515625 | -12.6 |
| 22.859375 | -11.9 |
| 22.8671875 | -13.1 |
| 22.875 | -13.5 |
| 22.8828125 | -10.5 |
| 22.890625 | -5.4 |
| 22.8984375 | 0.7 |
| 22.90625 | 8.4 |
| 22.9140625 | 11.7 |
| 22.921875 | 10.4 |
| 22.9296875 | 16.5 |
| 22.9375 | 27.7 |
| 22.9453125 | 30.9 |
| 22.953125 | 30.1 |
| 22.9609375 | 30.6 |
| 22.96875 | 28.8 |
| 22.9765625 | 25.6 |
| 22.984375 | 20.5 |
| 22.9921875 | 11.6 |
| 23.0 | 5.7 |
| 23.0078125 | 1.9 |
| 23.015625 | -7 |
| 23.0234375 | -16.5 |
| 23.03125 | -19.1 |
| 23.0390625 | -15.9 |
| 23.046875 | -13 |
| 23.0546875 | -15.6 |
| 23.0625 | -16.6 |
| 23.0703125 | -8.9 |
| 23.078125 | -2.3 |
| 23.0859375 | -2.4 |
| 23.09375 | -4.5 |
| 23.1015625 | -10.6 |
| 23.109375 | -15.4 |
| 23.1171875 | -12.9 |
| 23.125 | -12.4 |
| 23.1328125 | -13.5 |
| 23.140625 | -11.4 |
| 23.1484375 | -14.3 |
| 23.15625 | -19.4 |
| 23.1640625 | -20.3 |
| 23.171875 | -23.4 |
| 23.1796875 | -27.1 |
| 23.1875 | -27.9 |
| 23.1953125 | -32.3 |
| 23.203125 | -37.2 |
| 23.2109375 | -37 |
| 23.21875 | -36.7 |
| 23.2265625 | -38 |
| 23.234375 | -39.7 |
| 23.2421875 | -43.6 |
| 23.25 | -44.6 |
| 23.2578125 | -38.3 |
| 23.265625 | -30.2 |
| 23.2734375 | -24.7 |
| 23.28125 | -21.5 |
| 23.2890625 | -21.1 |
| 23.296875 | -21.5 |
| 23.3046875 | -20.1 |
| 23.3125 | -19.3 |
| 23.3203125 | -17.4 |
| 23.328125 | -13.1 |
| 23.3359375 | -12.8 |
| 23.34375 | -15.6 |
| 23.3515625 | -12.3 |
| 23.359375 | -5.3 |
| 23.3671875 | -2.3 |
| 23.375 | -1.2 |
| 23.3828125 | -0.8 |
| 23.390625 | -4.7 |
| 23.3984375 | -9 |
| 23.40625 | -8.9 |
| 23.4140625 | -9.5 |
| 23.421875 | -13.6 |
| 23.4296875 | -16.4 |
| 23.4375 | -17.2 |
| 23.4453125 | -21.6 |
| 23.453125 | -28.6 |
| 23.4609375 | -29.9 |
| 23.46875 | -26.9 |
| 23.4765625 | -27.3 |
| 23.484375 | -26.8 |
| 23.4921875 | -22.8 |
| 23.5 | -20.5 |
| 23.5078125 | -19.9 |
| 23.515625 | -18.7 |
| 23.5234375 | -16.1 |
| 23.53125 | -12.8 |
| 23.5390625 | -12.2 |
| 23.546875 | -11.1 |
| 23.5546875 | -6.4 |
| 23.5625 | -2.9 |
| 23.5703125 | 2 |
| 23.578125 | 10.6 |
| 23.5859375 | 16.8 |
| 23.59375 | 21.9 |
| 23.6015625 | 26 |
| 23.609375 | 25.3 |
| 23.6171875 | 24.6 |
| 23.625 | 21.8 |
| 23.6328125 | 13 |
| 23.640625 | 10.6 |
| 23.6484375 | 15.6 |
| 23.65625 | 14.4 |
| 23.6640625 | 10.3 |
| 23.671875 | 11.6 |
| 23.6796875 | 10 |
| 23.6875 | 2.6 |
| 23.6953125 | 0.8 |
| 23.703125 | 6.8 |
| 23.7109375 | 15.4 |
| 23.71875 | 26.1 |
| 23.7265625 | 34.3 |
| 23.734375 | 34.3 |
| 23.7421875 | 29.9 |
| 23.75 | 25.6 |
| 23.7578125 | 23.3 |
| 23.765625 | 24.3 |
| 23.7734375 | 28.5 |
| 23.78125 | 40.3 |
| 23.7890625 | 54.9 |
| 23.796875 | 63.8 |
| 23.8046875 | 74.5 |
| 23.8125 | 86.1 |
| 23.8203125 | 87 |
| 23.828125 | 88.1 |
| 23.8359375 | 98.6 |
| 23.84375 | 108.1 |
| 23.8515625 | 114.6 |
| 23.859375 | 119.2 |
| 23.8671875 | 118.2 |
| 23.875 | 115.6 |
| 23.8828125 | 114.9 |
| 23.890625 | 116.9 |
| 23.8984375 | 121.3 |
| 23.90625 | 122.4 |
| 23.9140625 | 122.6 |
| 23.921875 | 127.4 |
| 23.9296875 | 129.4 |
| 23.9375 | 129 |
| 23.9453125 | 132.5 |
| 23.953125 | 132.6 |
| 23.9609375 | 128.2 |
| 23.96875 | 125.5 |
| 23.9765625 | 117.1 |
| 23.984375 | 102.1 |
| 23.9921875 | 91 |
| 24.0 | 81.5 |
| 24.0078125 | 65.4 |
| 24.015625 | 45.4 |
| 24.0234375 | 25.2 |
| 24.03125 | 1.7 |
| 24.0390625 | -24.9 |
| 24.046875 | -44.8 |
| 24.0546875 | -55.4 |
| 24.0625 | -67.4 |
| 24.0703125 | -82.2 |
| 24.078125 | -92.3 |
| 24.0859375 | -97.8 |
| 24.09375 | -99.3 |
| 24.1015625 | -95.6 |
| 24.109375 | -89.3 |
| 24.1171875 | -79.9 |
| 24.125 | -65 |
| 24.1328125 | -45.5 |
| 24.140625 | -24.8 |
| 24.1484375 | -6.8 |
| 24.15625 | 9.3 |
| 24.1640625 | 25 |
| 24.171875 | 33.1 |
| 24.1796875 | 27 |
| 24.1875 | 11.2 |
| 24.1953125 | -9.3 |
| 24.203125 | -33.8 |
| 24.2109375 | -63.2 |
| 24.21875 | -97.4 |
| 24.2265625 | -129.7 |
| 24.234375 | -152.7 |
| 24.2421875 | -165.9 |
| 24.25 | -172 |
| 24.2578125 | -174.1 |
| 24.265625 | -174 |
| 24.2734375 | -171.7 |
| 24.28125 | -169.4 |
| 24.2890625 | -162.8 |
| 24.296875 | -142.6 |
| 24.3046875 | -115.5 |
| 24.3125 | -93.3 |
| 24.3203125 | -77.4 |
| 24.328125 | -74.3 |
| 24.3359375 | -91.9 |
| 24.34375 | -120.8 |
| 24.3515625 | -147.9 |
| 24.359375 | -168 |
| 24.3671875 | -178.5 |
| 24.375 | -184.3 |
| 24.3828125 | -190.8 |
| 24.390625 | -191.6 |
| 24.3984375 | -186.9 |
| 24.40625 | -184.9 |
| 24.4140625 | -178.4 |
| 24.421875 | -161.2 |
| 24.4296875 | -143.2 |
| 24.4375 | -125.9 |
| 24.4453125 | -104.2 |
| 24.453125 | -81.3 |
| 24.4609375 | -59.2 |
| 24.46875 | -34.3 |
| 24.4765625 | -6 |
| 24.484375 | 19.9 |
| 24.4921875 | 36.2 |
| 24.5 | 44 |
| 24.5078125 | 46.8 |
| 24.515625 | 45.3 |
| 24.5234375 | 42.3 |
| 24.53125 | 39.4 |
| 24.5390625 | 35.4 |
| 24.546875 | 30.5 |
| 24.5546875 | 26.6 |
| 24.5625 | 25.2 |
| 24.5703125 | 26.7 |
| 24.578125 | 31.3 |
| 24.5859375 | 35.7 |
| 24.59375 | 37.8 |
| 24.6015625 | 43.1 |
| 24.609375 | 55.1 |
| 24.6171875 | 67 |
| 24.625 | 73.2 |
| 24.6328125 | 75.2 |
| 24.640625 | 75.7 |
| 24.6484375 | 71.2 |
| 24.65625 | 57.8 |
| 24.6640625 | 41.2 |
| 24.671875 | 27.4 |
| 24.6796875 | 18.4 |
| 24.6875 | 16.5 |
| 24.6953125 | 19.1 |
| 24.703125 | 23.4 |
| 24.7109375 | 32.8 |
| 24.71875 | 47.5 |
| 24.7265625 | 64.3 |
| 24.734375 | 80.6 |
| 24.7421875 | 92.9 |
| 24.75 | 100.6 |
| 24.7578125 | 106.7 |
| 24.765625 | 110.3 |
| 24.7734375 | 107.5 |
| 24.78125 | 99 |
| 24.7890625 | 89.3 |
| 24.796875 | 75.6 |
| 24.8046875 | 53.3 |
| 24.8125 | 23.2 |
| 24.8203125 | -12.3 |
| 24.828125 | -41.6 |
| 24.8359375 | -53.2 |
| 24.84375 | -54.7 |
| 24.8515625 | -51.4 |
| 24.859375 | -40.7 |
| 24.8671875 | -35.6 |
| 24.875 | -39.5 |
| 24.8828125 | -35.9 |
| 24.890625 | -27.3 |
| 24.8984375 | -25.3 |
| 24.90625 | -26.2 |
| 24.9140625 | -27.2 |
| 24.921875 | -26.3 |
| 24.9296875 | -19.8 |
| 24.9375 | -14.1 |
| 24.9453125 | -16.1 |
| 24.953125 | -25.8 |
| 24.9609375 | -37.9 |
| 24.96875 | -41.3 |
| 24.9765625 | -35.5 |
| 24.984375 | -27.5 |
| 24.9921875 | -12.3 |
| 25.0 | 10 |
| 25.0078125 | 32.1 |
| 25.015625 | 59.3 |
| 25.0234375 | 87.1 |
| 25.03125 | 99.3 |
| 25.0390625 | 101.5 |
| 25.046875 | 104.1 |
| 25.0546875 | 102.5 |
| 25.0625 | 97.3 |
| 25.0703125 | 94.5 |
| 25.078125 | 93.8 |
| 25.0859375 | 95.1 |
| 25.09375 | 93.9 |
| 25.1015625 | 85 |
| 25.109375 | 74.1 |
| 25.1171875 | 63.4 |
| 25.125 | 51.4 |
| 25.1328125 | 44 |
| 25.140625 | 41.3 |
| 25.1484375 | 38.7 |
| 25.15625 | 41.2 |
| 25.1640625 | 50.7 |
| 25.171875 | 58.7 |
| 25.1796875 | 60.7 |
| 25.1875 | 57.9 |
| 25.1953125 | 52.9 |
| 25.203125 | 48.9 |
| 25.2109375 | 44.4 |
| 25.21875 | 41.4 |
| 25.2265625 | 49 |
| 25.234375 | 64.1 |
| 25.2421875 | 76.1 |
| 25.25 | 82.8 |
| 25.2578125 | 82.6 |
| 25.265625 | 78.5 |
| 25.2734375 | 78 |
| 25.28125 | 77 |
| 25.2890625 | 77.3 |
| 25.296875 | 85.4 |
| 25.3046875 | 92.1 |
| 25.3125 | 97.8 |
| 25.3203125 | 107.3 |
| 25.328125 | 109.8 |
| 25.3359375 | 108.5 |
| 25.34375 | 111.2 |
| 25.3515625 | 107.8 |
| 25.359375 | 100.8 |
| 25.3671875 | 98.9 |
| 25.375 | 98 |
| 25.3828125 | 100.5 |
| 25.390625 | 108.5 |
| 25.3984375 | 115.8 |
| 25.40625 | 123.6 |
| 25.4140625 | 134.5 |
| 25.421875 | 144.7 |
| 25.4296875 | 151.1 |
| 25.4375 | 154.6 |
| 25.4453125 | 154 |
| 25.453125 | 147.2 |
| 25.4609375 | 137.9 |
| 25.46875 | 126.8 |
| 25.4765625 | 113 |
| 25.484375 | 105.5 |
| 25.4921875 | 100.4 |
| 25.5 | 85.4 |
| 25.5078125 | 69 |
| 25.515625 | 53.7 |
| 25.5234375 | 26.9 |
| 25.53125 | -5.7 |
| 25.5390625 | -33.7 |
| 25.546875 | -58.8 |
| 25.5546875 | -80.2 |
| 25.5625 | -101 |
| 25.5703125 | -124.2 |
| 25.578125 | -141.3 |
| 25.5859375 | -149.9 |
| 25.59375 | -157.7 |
| 25.6015625 | -163.2 |
| 25.609375 | -162.5 |
| 25.6171875 | -160.9 |
| 25.625 | -160.7 |
| 25.6328125 | -159.4 |
| 25.640625 | -160.1 |
| 25.6484375 | -161 |
| 25.65625 | -154.2 |
| 25.6640625 | -145.3 |
| 25.671875 | -144 |
| 25.6796875 | -147.6 |
| 25.6875 | -154.4 |
| 25.6953125 | -164.8 |
| 25.703125 | -173.8 |
| 25.7109375 | -181.6 |
| 25.71875 | -188.7 |
| 25.7265625 | -190.9 |
| 25.734375 | -191.2 |
| 25.7421875 | -191.2 |
| 25.75 | -184.7 |
| 25.7578125 | -175 |
| 25.765625 | -164.5 |
| 25.7734375 | -145.8 |
| 25.78125 | -122.7 |
| 25.7890625 | -103 |
| 25.796875 | -85.4 |
| 25.8046875 | -72.5 |
| 25.8125 | -67.2 |
| 25.8203125 | -64.2 |
| 25.828125 | -59.2 |
| 25.8359375 | -50.9 |
| 25.84375 | -41.3 |
| 25.8515625 | -35.6 |
| 25.859375 | -31.2 |
| 25.8671875 | -20.3 |
| 25.875 | -5.9 |
| 25.8828125 | 3.5 |
| 25.890625 | 7.8 |
| 25.8984375 | 10.1 |
| 25.90625 | 10.8 |
| 25.9140625 | 11.3 |
| 25.921875 | 12.9 |
| 25.9296875 | 12.7 |
| 25.9375 | 7.7 |
| 25.9453125 | 0.5 |
| 25.953125 | -2.2 |
| 25.9609375 | -1 |
| 25.96875 | -0.4 |
| 25.9765625 | 4.4 |
| 25.984375 | 11.6 |
| 25.9921875 | 11.8 |
| 26.0 | 12.3 |
| 26.0078125 | 19.3 |
| 26.015625 | 23.7 |
| 26.0234375 | 30.9 |
| 26.03125 | 48.1 |
| 26.0390625 | 66.1 |
| 26.046875 | 82.1 |
| 26.0546875 | 98 |
| 26.0625 | 112.9 |
| 26.0703125 | 130.3 |
| 26.078125 | 144.2 |
| 26.0859375 | 147.7 |
| 26.09375 | 148.2 |
| 26.1015625 | 146.4 |
| 26.109375 | 138.9 |
| 26.1171875 | 133.3 |
| 26.125 | 127.1 |
| 26.1328125 | 111.8 |
| 26.140625 | 96.2 |
| 26.1484375 | 89.4 |
| 26.15625 | 85.6 |
| 26.1640625 | 83.4 |
| 26.171875 | 84.2 |
| 26.1796875 | 80.6 |
| 26.1875 | 71 |
| 26.1953125 | 60 |
| 26.203125 | 48.2 |
| 26.2109375 | 40.6 |
| 26.21875 | 40.1 |
| 26.2265625 | 39.8 |
| 26.234375 | 34.2 |
| 26.2421875 | 22.3 |
| 26.25 | 8 |
| 26.2578125 | -3.1 |
| 26.265625 | -16.4 |
| 26.2734375 | -34.2 |
| 26.28125 | -48 |
| 26.2890625 | -57.9 |
| 26.296875 | -68.5 |
| 26.3046875 | -78.9 |
| 26.3125 | -88.8 |
| 26.3203125 | -95.1 |
| 26.328125 | -94.9 |
| 26.3359375 | -94.9 |
| 26.34375 | -99 |
| 26.3515625 | -102.2 |
| 26.359375 | -103.8 |
| 26.3671875 | -107.8 |
| 26.375 | -114.6 |
| 26.3828125 | -119.5 |
| 26.390625 | -119.5 |
| 26.3984375 | -120.1 |
| 26.40625 | -124.4 |
| 26.4140625 | -127.6 |
| 26.421875 | -132.5 |
| 26.4296875 | -138.6 |
| 26.4375 | -133.4 |
| 26.4453125 | -124.3 |
| 26.453125 | -126.6 |
| 26.4609375 | -132.6 |
| 26.46875 | -140.3 |
| 26.4765625 | -151.2 |
| 26.484375 | -154.1 |
| 26.4921875 | -151.8 |
| 26.5 | -150.9 |
| 26.5078125 | -146.2 |
| 26.515625 | -143.7 |
| 26.5234375 | -148.1 |
| 26.53125 | -151.9 |
| 26.5390625 | -151.7 |
| 26.546875 | -148.4 |
| 26.5546875 | -148.7 |
| 26.5625 | -155.9 |
| 26.5703125 | -160 |
| 26.578125 | -159.5 |
| 26.5859375 | -160.5 |
| 26.59375 | -159.9 |
| 26.6015625 | -155.1 |
| 26.609375 | -148.7 |
| 26.6171875 | -143.3 |
| 26.625 | -136.4 |
| 26.6328125 | -126 |
| 26.640625 | -119.2 |
| 26.6484375 | -112.6 |
| 26.65625 | -96.3 |
| 26.6640625 | -77.1 |
| 26.671875 | -59.9 |
| 26.6796875 | -41.6 |
| 26.6875 | -23.2 |
| 26.6953125 | -5.3 |
| 26.703125 | 7.5 |
| 26.7109375 | 14.3 |
| 26.71875 | 25.3 |
| 26.7265625 | 38.2 |
| 26.734375 | 46.2 |
| 26.7421875 | 56.7 |
| 26.75 | 71.8 |
| 26.7578125 | 84.5 |
| 26.765625 | 92.1 |
| 26.7734375 | 96.8 |
| 26.78125 | 100 |
| 26.7890625 | 100.2 |
| 26.796875 | 98.9 |
| 26.8046875 | 99.5 |
| 26.8125 | 104.2 |
| 26.8203125 | 115.5 |
| 26.828125 | 129.4 |
| 26.8359375 | 143.1 |
| 26.84375 | 159.4 |
| 26.8515625 | 171.4 |
| 26.859375 | 178.8 |
| 26.8671875 | 193.5 |
| 26.875 | 213.2 |
| 26.8828125 | 232.3 |
| 26.890625 | 256.3 |
| 26.8984375 | 287.9 |
| 26.90625 | 318.7 |
| 26.9140625 | 336.1 |
| 26.921875 | 340.6 |
| 26.9296875 | 338.8 |
| 26.9375 | 324.7 |
| 26.9453125 | 298 |
| 26.953125 | 268.7 |
| 26.9609375 | 237.7 |
| 26.96875 | 206.1 |
| 26.9765625 | 181.3 |
| 26.984375 | 164.8 |
| 26.9921875 | 154.1 |
| 27.0 | 145.6 |
| 27.0078125 | 137.1 |
| 27.015625 | 124.5 |
| 27.0234375 | 97.7 |
| 27.03125 | 61.8 |
| 27.0390625 | 35.3 |
| 27.046875 | 19.6 |
| 27.0546875 | 9.3 |
| 27.0625 | 10.5 |
| 27.0703125 | 18 |
| 27.078125 | 18.2 |
| 27.0859375 | 9.7 |
| 27.09375 | -0.9 |
| 27.1015625 | -8.3 |
| 27.109375 | -10.7 |
| 27.1171875 | -6.4 |
| 27.125 | 3.7 |
| 27.1328125 | 15.8 |
| 27.140625 | 30.8 |
| 27.1484375 | 46.8 |
| 27.15625 | 57.8 |
| 27.1640625 | 65.2 |
| 27.171875 | 69.5 |
| 27.1796875 | 68.1 |
| 27.1875 | 68 |
| 27.1953125 | 68.5 |
| 27.203125 | 54.2 |
| 27.2109375 | 24 |
| 27.21875 | -8.2 |
| 27.2265625 | -36.1 |
| 27.234375 | -57.1 |
| 27.2421875 | -60.8 |
| 27.25 | -48.4 |
| 27.2578125 | -41.8 |
| 27.265625 | -49.3 |
| 27.2734375 | -60.9 |
| 27.28125 | -77.2 |
| 27.2890625 | -100.9 |
| 27.296875 | -124.8 |
| 27.3046875 | -142.8 |
| 27.3125 | -153.5 |
| 27.3203125 | -159.4 |
| 27.328125 | -164.5 |
| 27.3359375 | -167.5 |
| 27.34375 | -164.5 |
| 27.3515625 | -154 |
| 27.359375 | -143.1 |
| 27.3671875 | -142.6 |
| 27.375 | -145.6 |
| 27.3828125 | -139.8 |
| 27.390625 | -133.6 |
| 27.3984375 | -135.5 |
| 27.40625 | -141.4 |
| 27.4140625 | -149.2 |
| 27.421875 | -154.6 |
| 27.4296875 | -154.1 |
| 27.4375 | -153 |
| 27.4453125 | -154.7 |
| 27.453125 | -157.8 |
| 27.4609375 | -158.4 |
| 27.46875 | -154.3 |
| 27.4765625 | -151 |
| 27.484375 | -151 |
| 27.4921875 | -151.1 |
| 27.5 | -150.8 |
| 27.5078125 | -147 |
| 27.515625 | -138.9 |
| 27.5234375 | -131.1 |
| 27.53125 | -124.5 |
| 27.5390625 | -117.7 |
| 27.546875 | -107.6 |
| 27.5546875 | -94 |
| 27.5625 | -86.2 |
| 27.5703125 | -84.8 |
| 27.578125 | -81.6 |
| 27.5859375 | -75.7 |
| 27.59375 | -63.2 |
| 27.6015625 | -42.9 |
| 27.609375 | -26 |
| 27.6171875 | -15.5 |
| 27.625 | -5.8 |
| 27.6328125 | 2.5 |
| 27.640625 | 10.7 |
| 27.6484375 | 19.3 |
| 27.65625 | 22.3 |
| 27.6640625 | 20.8 |
| 27.671875 | 20.5 |
| 27.6796875 | 19.6 |
| 27.6875 | 18.5 |
| 27.6953125 | 22.6 |
| 27.703125 | 30.1 |
| 27.7109375 | 36.9 |
| 27.71875 | 44.3 |
| 27.7265625 | 53.5 |
| 27.734375 | 64 |
| 27.7421875 | 76.1 |
| 27.75 | 89.2 |
| 27.7578125 | 101 |
| 27.765625 | 108.7 |
| 27.7734375 | 110.8 |
| 27.78125 | 108.3 |
| 27.7890625 | 101.8 |
| 27.796875 | 91.5 |
| 27.8046875 | 81.5 |
| 27.8125 | 75.8 |
| 27.8203125 | 71.5 |
| 27.828125 | 65 |
| 27.8359375 | 61.4 |
| 27.84375 | 64.4 |
| 27.8515625 | 69.3 |
| 27.859375 | 75.5 |
| 27.8671875 | 86.2 |
| 27.875 | 95.3 |
| 27.8828125 | 97.4 |
| 27.890625 | 96 |
| 27.8984375 | 93.7 |
| 27.90625 | 90.3 |
| 27.9140625 | 86 |
| 27.921875 | 83.5 |
| 27.9296875 | 84.5 |
| 27.9375 | 86.7 |
| 27.9453125 | 89.2 |
| 27.953125 | 91.7 |
| 27.9609375 | 87.2 |
| 27.96875 | 77.3 |
| 27.9765625 | 71.2 |
| 27.984375 | 66.5 |
| 27.9921875 | 61.5 |
| 28.0 | 63.3 |
| 28.0078125 | 66.4 |
| 28.015625 | 63 |
| 28.0234375 | 58.9 |
| 28.03125 | 53.7 |
| 28.0390625 | 44.2 |
| 28.046875 | 37.4 |
| 28.0546875 | 35.1 |
| 28.0625 | 34.3 |
| 28.0703125 | 35.1 |
| 28.078125 | 35.3 |
| 28.0859375 | 38.5 |
| 28.09375 | 49.6 |
| 28.1015625 | 57.8 |
| 28.109375 | 55.1 |
| 28.1171875 | 51.9 |
| 28.125 | 51.9 |
| 28.1328125 | 46.5 |
| 28.140625 | 40.7 |
| 28.1484375 | 44.2 |
| 28.15625 | 48.1 |
| 28.1640625 | 46.7 |
| 28.171875 | 49.2 |
| 28.1796875 | 51.5 |
| 28.1875 | 44 |
| 28.1953125 | 36.4 |
| 28.203125 | 33.1 |
| 28.2109375 | 27 |
| 28.21875 | 22.9 |
| 28.2265625 | 22.8 |
| 28.234375 | 21 |
| 28.2421875 | 21.8 |
| 28.25 | 26.8 |
| 28.2578125 | 27.5 |
| 28.265625 | 25.9 |
| 28.2734375 | 27.5 |
| 28.28125 | 30.2 |
| 28.2890625 | 34.4 |
| 28.296875 | 42.9 |
| 28.3046875 | 50.8 |
| 28.3125 | 54.2 |
| 28.3203125 | 58.5 |
| 28.328125 | 62 |
| 28.3359375 | 54 |
| 28.34375 | 41.9 |
| 28.3515625 | 38.8 |
| 28.359375 | 37.6 |
| 28.3671875 | 31.3 |
| 28.375 | 25.9 |
| 28.3828125 | 24.2 |
| 28.390625 | 25.9 |
| 28.3984375 | 32 |
| 28.40625 | 40.4 |
| 28.4140625 | 46.4 |
| 28.421875 | 46.8 |
| 28.4296875 | 43 |
| 28.4375 | 34.9 |
| 28.4453125 | 26.3 |
| 28.453125 | 25 |
| 28.4609375 | 22.1 |
| 28.46875 | 11.1 |
| 28.4765625 | 6.1 |
| 28.484375 | 4.6 |
| 28.4921875 | -1.9 |
| 28.5 | -3.2 |
| 28.5078125 | -2.8 |
| 28.515625 | -10.1 |
| 28.5234375 | -12.5 |
| 28.53125 | -6.7 |
| 28.5390625 | -5.7 |
| 28.546875 | -10.3 |
| 28.5546875 | -11.1 |
| 28.5625 | -7.7 |
| 28.5703125 | -7.6 |
| 28.578125 | -14.1 |
| 28.5859375 | -23.4 |
| 28.59375 | -34.5 |
| 28.6015625 | -48.2 |
| 28.609375 | -57.6 |
| 28.6171875 | -56.8 |
| 28.625 | -56 |
| 28.6328125 | -64.8 |
| 28.640625 | -72.9 |
| 28.6484375 | -73.9 |
| 28.65625 | -76.4 |
| 28.6640625 | -78.3 |
| 28.671875 | -71.7 |
| 28.6796875 | -61.6 |
| 28.6875 | -55.6 |
| 28.6953125 | -51.5 |
| 28.703125 | -41.5 |
| 28.7109375 | -29 |
| 28.71875 | -27.4 |
| 28.7265625 | -33.3 |
| 28.734375 | -36.9 |
| 28.7421875 | -40.9 |
| 28.75 | -43.9 |
| 28.7578125 | -44.3 |
| 28.765625 | -44.7 |
| 28.7734375 | -39.9 |
| 28.78125 | -34.7 |
| 28.7890625 | -38.8 |
| 28.796875 | -40.4 |
| 28.8046875 | -32.3 |
| 28.8125 | -26.6 |
| 28.8203125 | -26.7 |
| 28.828125 | -27.4 |
| 28.8359375 | -29.7 |
| 28.84375 | -33.2 |
| 28.8515625 | -34.6 |
| 28.859375 | -34.7 |
| 28.8671875 | -34.9 |
| 28.875 | -31.6 |
| 28.8828125 | -27.6 |
| 28.890625 | -30.6 |
| 28.8984375 | -35.2 |
| 28.90625 | -33.9 |
| 28.9140625 | -31.5 |
| 28.921875 | -29.8 |
| 28.9296875 | -26.2 |
| 28.9375 | -22.6 |
| 28.9453125 | -20.4 |
| 28.953125 | -20.8 |
| 28.9609375 | -24.1 |
| 28.96875 | -26.3 |
| 28.9765625 | -28.1 |
| 28.984375 | -33.8 |
| 28.9921875 | -38.2 |
| 29.0 | -36.2 |
| 29.0078125 | -32 |
| 29.015625 | -26.9 |
| 29.0234375 | -19.7 |
| 29.03125 | -16 |
| 29.0390625 | -17.8 |
| 29.046875 | -18.9 |
| 29.0546875 | -13.3 |
| 29.0625 | -4.6 |
| 29.0703125 | -0.7 |
| 29.078125 | -2.1 |
| 29.0859375 | -5.3 |
| 29.09375 | -8.7 |
| 29.1015625 | -9.7 |
| 29.109375 | -9.1 |
| 29.1171875 | -9 |
| 29.125 | -9.3 |
| 29.1328125 | -11.6 |
| 29.140625 | -11.4 |
| 29.1484375 | -6.8 |
| 29.15625 | -6.2 |
| 29.1640625 | -7 |
| 29.171875 | -5.8 |
| 29.1796875 | -12 |
| 29.1875 | -23.5 |
| 29.1953125 | -30.1 |
| 29.203125 | -31.7 |
| 29.2109375 | -29.7 |
| 29.21875 | -28.6 |
| 29.2265625 | -31.2 |
| 29.234375 | -32.4 |
| 29.2421875 | -33.5 |
| 29.25 | -37.5 |
| 29.2578125 | -39.2 |
| 29.265625 | -39.2 |
| 29.2734375 | -40.2 |
| 29.28125 | -38.8 |
| 29.2890625 | -36.1 |
| 29.296875 | -34.7 |
| 29.3046875 | -31 |
| 29.3125 | -27.1 |
| 29.3203125 | -28 |
| 29.328125 | -31 |
| 29.3359375 | -31 |
| 29.34375 | -27.9 |
| 29.3515625 | -25.4 |
| 29.359375 | -26 |
| 29.3671875 | -26.7 |
| 29.375 | -26.1 |
| 29.3828125 | -27.6 |
| 29.390625 | -29.9 |
| 29.3984375 | -30 |
| 29.40625 | -26.9 |
| 29.4140625 | -22.3 |
| 29.421875 | -23 |
| 29.4296875 | -26 |
| 29.4375 | -22.2 |
| 29.4453125 | -19 |
| 29.453125 | -20.8 |
| 29.4609375 | -20.1 |
| 29.46875 | -22 |
| 29.4765625 | -30.4 |
| 29.484375 | -36.1 |
| 29.4921875 | -38 |
| 29.5 | -41.7 |
| 29.5078125 | -48.5 |
| 29.515625 | -55.7 |
| 29.5234375 | -58 |
| 29.53125 | -56.8 |
| 29.5390625 | -56.4 |
| 29.546875 | -54.5 |
| 29.5546875 | -48.2 |
| 29.5625 | -37.8 |
| 29.5703125 | -28.9 |
| 29.578125 | -30.1 |
| 29.5859375 | -34.3 |
| 29.59375 | -27.9 |
| 29.6015625 | -21.2 |
| 29.609375 | -24.9 |
| 29.6171875 | -22.1 |
| 29.625 | -6.9 |
| 29.6328125 | 3.3 |
| 29.640625 | 8.1 |
| 29.6484375 | 14.9 |
| 29.65625 | 18 |
| 29.6640625 | 18 |
| 29.671875 | 17.9 |
| 29.6796875 | 17.5 |
| 29.6875 | 23.3 |
| 29.6953125 | 30.7 |
| 29.703125 | 28.6 |
| 29.7109375 | 26.7 |
| 29.71875 | 31.3 |
| 29.7265625 | 33.4 |
| 29.734375 | 37 |
| 29.7421875 | 44.6 |
| 29.75 | 45.4 |
| 29.7578125 | 41.3 |
| 29.765625 | 42.7 |
| 29.7734375 | 46.6 |
| 29.78125 | 43.9 |
| 29.7890625 | 35 |
| 29.796875 | 26.5 |
| 29.8046875 | 15.3 |
| 29.8125 | -0.4 |
| 29.8203125 | -6.6 |
| 29.828125 | -1.9 |
| 29.8359375 | 0.9 |
| 29.84375 | 3.2 |
| 29.8515625 | 5.8 |
| 29.859375 | 6.1 |
| 29.8671875 | 9.5 |
| 29.875 | 10.4 |
| 29.8828125 | 4.3 |
| 29.890625 | -0.6 |
| 29.8984375 | -5.9 |
| 29.90625 | -10.5 |
| 29.9140625 | -9.7 |
| 29.921875 | -11.7 |
| 29.9296875 | -13.5 |
| 29.9375 | -9.8 |
| 29.9453125 | -9.5 |
| 29.953125 | -8.6 |
| 29.9609375 | -1.9 |
| 29.96875 | 1.2 |
| 29.9765625 | 6.4 |
| 29.984375 | 19.1 |
| 29.9921875 | 24.7 |
| 30.0 | 23.2 |
| 30.0078125 | 28.4 |
| 30.015625 | 38.2 |
| 30.0234375 | 43.1 |
| 30.03125 | 42.9 |
| 30.0390625 | 42.6 |
| 30.046875 | 43.9 |
| 30.0546875 | 43.4 |
| 30.0625 | 37.6 |
| 30.0703125 | 27 |
| 30.078125 | 17.9 |
| 30.0859375 | 17.6 |
| 30.09375 | 22 |
| 30.1015625 | 22.3 |
| 30.109375 | 20.1 |
| 30.1171875 | 18.9 |
| 30.125 | 18.7 |
| 30.1328125 | 18.2 |
| 30.140625 | 15.3 |
| 30.1484375 | 11.6 |
| 30.15625 | 8.9 |
| 30.1640625 | 4.6 |
| 30.171875 | -0.9 |
| 30.1796875 | -3.5 |
| 30.1875 | -2.5 |
| 30.1953125 | 0.8 |
| 30.203125 | 2.2 |
| 30.2109375 | -1.9 |
| 30.21875 | -5.8 |
| 30.2265625 | -2.2 |
| 30.234375 | 4.6 |
| 30.2421875 | 10.2 |
| 30.25 | 18.3 |
| 30.2578125 | 24 |
| 30.265625 | 23.6 |
| 30.2734375 | 25.6 |
| 30.28125 | 26.8 |
| 30.2890625 | 22.7 |
| 30.296875 | 23.9 |
| 30.3046875 | 28.5 |
| 30.3125 | 27.1 |
| 30.3203125 | 25.1 |
| 30.328125 | 23.2 |
| 30.3359375 | 21.6 |
| 30.34375 | 29.7 |
| 30.3515625 | 41.9 |
| 30.359375 | 45.9 |
| 30.3671875 | 45.2 |
| 30.375 | 45.6 |
| 30.3828125 | 44.1 |
| 30.390625 | 36.8 |
| 30.3984375 | 26.9 |
| 30.40625 | 20.4 |
| 30.4140625 | 17 |
| 30.421875 | 15.7 |
| 30.4296875 | 17.4 |
| 30.4375 | 20.9 |
| 30.4453125 | 27.4 |
| 30.453125 | 35 |
| 30.4609375 | 36.6 |
| 30.46875 | 30.8 |
| 30.4765625 | 21.4 |
| 30.484375 | 14.3 |
| 30.4921875 | 13 |
| 30.5 | 13.1 |
| 30.5078125 | 11.4 |
| 30.515625 | 9.3 |
| 30.5234375 | 8.4 |
| 30.53125 | 11.2 |
| 30.5390625 | 12.3 |
| 30.546875 | 5.5 |
| 30.5546875 | -2.7 |
| 30.5625 | -7.3 |
| 30.5703125 | -8.8 |
| 30.578125 | -5.6 |
| 30.5859375 | -3.5 |
| 30.59375 | -7 |
| 30.6015625 | -9.8 |
| 30.609375 | -10.8 |
| 30.6171875 | -12.6 |
| 30.625 | -17.6 |
| 30.6328125 | -28.7 |
| 30.640625 | -35.6 |
| 30.6484375 | -29.2 |
| 30.65625 | -21.8 |
| 30.6640625 | -19.5 |
| 30.671875 | -14.7 |
| 30.6796875 | -10.6 |
| 30.6875 | -9 |
| 30.6953125 | -4.1 |
| 30.703125 | -3.5 |
| 30.7109375 | -12.1 |
| 30.71875 | -16.3 |
| 30.7265625 | -10.9 |
| 30.734375 | -5.4 |
| 30.7421875 | -4.2 |
| 30.75 | -3.8 |
| 30.7578125 | 2.3 |
| 30.765625 | 11.8 |
| 30.7734375 | 14.2 |
| 30.78125 | 12.6 |
| 30.7890625 | 11.6 |
| 30.796875 | 4.5 |
| 30.8046875 | -5.6 |
| 30.8125 | -7.3 |
| 30.8203125 | -2.5 |
| 30.828125 | 2.2 |
| 30.8359375 | 5.8 |
| 30.84375 | 10.5 |
| 30.8515625 | 18.4 |
| 30.859375 | 27 |
| 30.8671875 | 31.7 |
| 30.875 | 32.1 |
| 30.8828125 | 29.3 |
| 30.890625 | 23.9 |
| 30.8984375 | 19.7 |
| 30.90625 | 19.2 |
| 30.9140625 | 17.3 |
| 30.921875 | 14 |
| 30.9296875 | 16.3 |
| 30.9375 | 22 |
| 30.9453125 | 22.8 |
| 30.953125 | 16.4 |
| 30.9609375 | 7.4 |
| 30.96875 | 3.1 |
| 30.9765625 | 3.1 |
| 30.984375 | -0.6 |
| 30.9921875 | -7.8 |
| 31.0 | -10.8 |
| 31.0078125 | -8.3 |
| 31.015625 | -5.4 |
| 31.0234375 | -6.8 |
| 31.03125 | -9 |
| 31.0390625 | -7.4 |
| 31.046875 | -7.7 |
| 31.0546875 | -16.6 |
| 31.0625 | -26.9 |
| 31.0703125 | -30.2 |
| 31.078125 | -27.9 |
| 31.0859375 | -22.7 |
| 31.09375 | -18.3 |
| 31.1015625 | -17.2 |
| 31.109375 | -9.7 |
| 31.1171875 | 4.3 |
| 31.125 | 8 |
| 31.1328125 | 3.3 |
| 31.140625 | 1.3 |
| 31.1484375 | -1.4 |
| 31.15625 | -2 |
| 31.1640625 | 3.4 |
| 31.171875 | 9.6 |
| 31.1796875 | 17.8 |
| 31.1875 | 26.9 |
| 31.1953125 | 32.3 |
| 31.203125 | 35.1 |
| 31.2109375 | 30.1 |
| 31.21875 | 16.7 |
| 31.2265625 | 5.4 |
| 31.234375 | -2.9 |
| 31.2421875 | -7.8 |
| 31.25 | -4.5 |
| 31.2578125 | 2.1 |
| 31.265625 | 4.7 |
| 31.2734375 | 2.7 |
| 31.28125 | 0.4 |
| 31.2890625 | -1.1 |
| 31.296875 | -9.4 |
| 31.3046875 | -20.4 |
| 31.3125 | -23.9 |
| 31.3203125 | -27.5 |
| 31.328125 | -34.2 |
| 31.3359375 | -33.2 |
| 31.34375 | -27.6 |
| 31.3515625 | -24.6 |
| 31.359375 | -20.7 |
| 31.3671875 | -17.7 |
| 31.375 | -15.8 |
| 31.3828125 | -9.9 |
| 31.390625 | -5.4 |
| 31.3984375 | -5.1 |
| 31.40625 | -1.1 |
| 31.4140625 | 4.4 |
| 31.421875 | 7.6 |
| 31.4296875 | 14.6 |
| 31.4375 | 21.6 |
| 31.4453125 | 21.7 |
| 31.453125 | 19.3 |
| 31.4609375 | 16.4 |
| 31.46875 | 12.3 |
| 31.4765625 | 8.5 |
| 31.484375 | 2.6 |
| 31.4921875 | -1.1 |
| 31.5 | 1.3 |
| 31.5078125 | 2.9 |
| 31.515625 | 3.3 |
| 31.5234375 | 4.3 |
| 31.53125 | 0.6 |
| 31.5390625 | -4.3 |
| 31.546875 | -4 |
| 31.5546875 | -3.6 |
| 31.5625 | -7.8 |
| 31.5703125 | -12.7 |
| 31.578125 | -11 |
| 31.5859375 | -4.5 |
| 31.59375 | -4.2 |
| 31.6015625 | -11.4 |
| 31.609375 | -16.4 |
| 31.6171875 | -13.2 |
| 31.625 | -4.7 |
| 31.6328125 | -0.6 |
| 31.640625 | -1.9 |
| 31.6484375 | 2.3 |
| 31.65625 | 10.9 |
| 31.6640625 | 10.8 |
| 31.671875 | 9.4 |
| 31.6796875 | 21.1 |
| 31.6875 | 34.8 |
| 31.6953125 | 38.9 |
| 31.703125 | 41.6 |
| 31.7109375 | 46.3 |
| 31.71875 | 46.9 |
| 31.7265625 | 42.2 |
| 31.734375 | 34.9 |
| 31.7421875 | 29.5 |
| 31.75 | 25.1 |
| 31.7578125 | 17.5 |
| 31.765625 | 11.7 |
| 31.7734375 | 10.5 |
| 31.78125 | 10.7 |
| 31.7890625 | 13.8 |
| 31.796875 | 16.4 |
| 31.8046875 | 14.2 |
| 31.8125 | 9.5 |
| 31.8203125 | 2.1 |
| 31.828125 | -4.1 |
| 31.8359375 | -4.4 |
| 31.84375 | -8.8 |
| 31.8515625 | -19 |
| 31.859375 | -20.7 |
| 31.8671875 | -13.3 |
| 31.875 | -8 |
| 31.8828125 | -8.8 |
| 31.890625 | -12.6 |
| 31.8984375 | -12 |
| 31.90625 | -3.8 |
| 31.9140625 | 3.3 |
| 31.921875 | 3.8 |
| 31.9296875 | 3 |
| 31.9375 | 3.8 |
| 31.9453125 | 5 |
| 31.953125 | 6.2 |
| 31.9609375 | 7.6 |
| 31.96875 | 7.3 |
| 31.9765625 | 4.3 |
| 31.984375 | 1.9 |
| 31.9921875 | -0.9 |